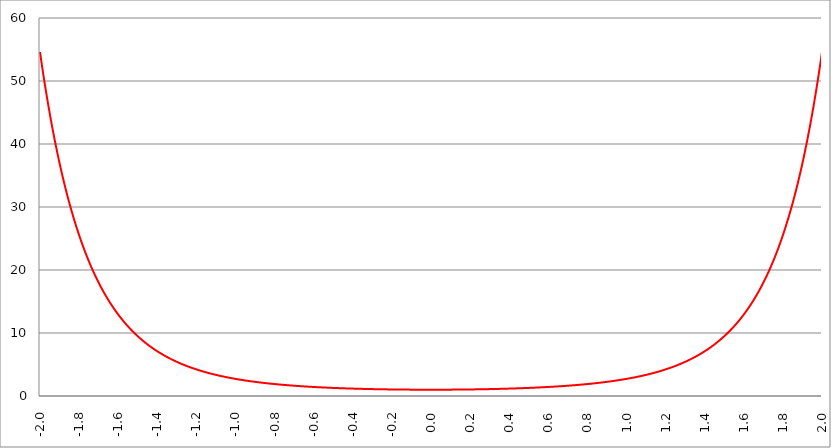
| Category | Series 1 | Series 0 | Series 2 |
|---|---|---|---|
| -2.0 | 54.598 |  |  |
| -1.998 | 54.163 |  |  |
| -1.996 | 53.732 |  |  |
| -1.994 | 53.305 |  |  |
| -1.992 | 52.882 |  |  |
| -1.99 | 52.463 |  |  |
| -1.988 | 52.047 |  |  |
| -1.986 | 51.635 |  |  |
| -1.984 | 51.226 |  |  |
| -1.982 | 50.822 |  |  |
| -1.98 | 50.421 |  |  |
| -1.978 | 50.023 |  |  |
| -1.976 | 49.629 |  |  |
| -1.974 | 49.239 |  |  |
| -1.972 | 48.851 |  |  |
| -1.97 | 48.468 |  |  |
| -1.968 | 48.088 |  |  |
| -1.966 | 47.711 |  |  |
| -1.964 | 47.337 |  |  |
| -1.962 | 46.967 |  |  |
| -1.96 | 46.6 |  |  |
| -1.958 | 46.236 |  |  |
| -1.956 | 45.876 |  |  |
| -1.954 | 45.518 |  |  |
| -1.952 | 45.164 |  |  |
| -1.95 | 44.813 |  |  |
| -1.948 | 44.465 |  |  |
| -1.946 | 44.12 |  |  |
| -1.944 | 43.778 |  |  |
| -1.942 | 43.439 |  |  |
| -1.94 | 43.103 |  |  |
| -1.938 | 42.77 |  |  |
| -1.936 | 42.44 |  |  |
| -1.934 | 42.113 |  |  |
| -1.932 | 41.789 |  |  |
| -1.93 | 41.467 |  |  |
| -1.928 | 41.148 |  |  |
| -1.926 | 40.832 |  |  |
| -1.924 | 40.519 |  |  |
| -1.922 | 40.209 |  |  |
| -1.92 | 39.901 |  |  |
| -1.918 | 39.596 |  |  |
| -1.916 | 39.293 |  |  |
| -1.914 | 38.994 |  |  |
| -1.912 | 38.696 |  |  |
| -1.91 | 38.402 |  |  |
| -1.908 | 38.11 |  |  |
| -1.906 | 37.82 |  |  |
| -1.904 | 37.533 |  |  |
| -1.902 | 37.248 |  |  |
| -1.9 | 36.966 |  |  |
| -1.898 | 36.686 |  |  |
| -1.896 | 36.409 |  |  |
| -1.894 | 36.134 |  |  |
| -1.892 | 35.861 |  |  |
| -1.89 | 35.591 |  |  |
| -1.888 | 35.323 |  |  |
| -1.886 | 35.058 |  |  |
| -1.884 | 34.794 |  |  |
| -1.882 | 34.533 |  |  |
| -1.88 | 34.274 |  |  |
| -1.878 | 34.018 |  |  |
| -1.876 | 33.763 |  |  |
| -1.874 | 33.511 |  |  |
| -1.872 | 33.261 |  |  |
| -1.87 | 33.013 |  |  |
| -1.868 | 32.767 |  |  |
| -1.866 | 32.523 |  |  |
| -1.864 | 32.282 |  |  |
| -1.862 | 32.042 |  |  |
| -1.86 | 31.804 |  |  |
| -1.858 | 31.569 |  |  |
| -1.856 | 31.335 |  |  |
| -1.854 | 31.103 |  |  |
| -1.852 | 30.874 |  |  |
| -1.85 | 30.646 |  |  |
| -1.848 | 30.42 |  |  |
| -1.846 | 30.196 |  |  |
| -1.844 | 29.974 |  |  |
| -1.842 | 29.754 |  |  |
| -1.84 | 29.536 |  |  |
| -1.838 | 29.319 |  |  |
| -1.836 | 29.105 |  |  |
| -1.834 | 28.892 |  |  |
| -1.832 | 28.681 |  |  |
| -1.83 | 28.471 |  |  |
| -1.828 | 28.264 |  |  |
| -1.826 | 28.058 |  |  |
| -1.824 | 27.854 |  |  |
| -1.822 | 27.652 |  |  |
| -1.82 | 27.451 |  |  |
| -1.818 | 27.252 |  |  |
| -1.816 | 27.055 |  |  |
| -1.814 | 26.859 |  |  |
| -1.812 | 26.665 |  |  |
| -1.81 | 26.472 |  |  |
| -1.808 | 26.281 |  |  |
| -1.806 | 26.092 |  |  |
| -1.804 | 25.904 |  |  |
| -1.802 | 25.718 |  |  |
| -1.8 | 25.534 |  |  |
| -1.798 | 25.351 |  |  |
| -1.796 | 25.169 |  |  |
| -1.794 | 24.989 |  |  |
| -1.792 | 24.81 |  |  |
| -1.79 | 24.633 |  |  |
| -1.788 | 24.458 |  |  |
| -1.786 | 24.283 |  |  |
| -1.784 | 24.111 |  |  |
| -1.782 | 23.939 |  |  |
| -1.78 | 23.769 |  |  |
| -1.778 | 23.601 |  |  |
| -1.776 | 23.434 |  |  |
| -1.774 | 23.268 |  |  |
| -1.772 | 23.103 |  |  |
| -1.77 | 22.94 |  |  |
| -1.768 | 22.779 |  |  |
| -1.766 | 22.618 |  |  |
| -1.764 | 22.459 |  |  |
| -1.762 | 22.301 |  |  |
| -1.76 | 22.145 |  |  |
| -1.758 | 21.989 |  |  |
| -1.756 | 21.835 |  |  |
| -1.754 | 21.683 |  |  |
| -1.752 | 21.531 |  |  |
| -1.75 | 21.381 |  |  |
| -1.748 | 21.232 |  |  |
| -1.746 | 21.084 |  |  |
| -1.744 | 20.937 |  |  |
| -1.742 | 20.792 |  |  |
| -1.74 | 20.648 |  |  |
| -1.738 | 20.504 |  |  |
| -1.736 | 20.363 |  |  |
| -1.734 | 20.222 |  |  |
| -1.732 | 20.082 |  |  |
| -1.73 | 19.943 |  |  |
| -1.728 | 19.806 |  |  |
| -1.726 | 19.67 |  |  |
| -1.724 | 19.534 |  |  |
| -1.722 | 19.4 |  |  |
| -1.72 | 19.267 |  |  |
| -1.718 | 19.135 |  |  |
| -1.716 | 19.004 |  |  |
| -1.714 | 18.874 |  |  |
| -1.712 | 18.745 |  |  |
| -1.71 | 18.617 |  |  |
| -1.708 | 18.491 |  |  |
| -1.706 | 18.365 |  |  |
| -1.704 | 18.24 |  |  |
| -1.702 | 18.116 |  |  |
| -1.7 | 17.993 |  |  |
| -1.698 | 17.871 |  |  |
| -1.696 | 17.751 |  |  |
| -1.694 | 17.631 |  |  |
| -1.692 | 17.512 |  |  |
| -1.69 | 17.394 |  |  |
| -1.688 | 17.276 |  |  |
| -1.686 | 17.16 |  |  |
| -1.684 | 17.045 |  |  |
| -1.682 | 16.931 |  |  |
| -1.68 | 16.817 |  |  |
| -1.678 | 16.705 |  |  |
| -1.676 | 16.593 |  |  |
| -1.674 | 16.482 |  |  |
| -1.672 | 16.372 |  |  |
| -1.67 | 16.263 |  |  |
| -1.668 | 16.155 |  |  |
| -1.666 | 16.048 |  |  |
| -1.664 | 15.941 |  |  |
| -1.662 | 15.835 |  |  |
| -1.66 | 15.73 |  |  |
| -1.658 | 15.626 |  |  |
| -1.656 | 15.523 |  |  |
| -1.654 | 15.421 |  |  |
| -1.652 | 15.319 |  |  |
| -1.65 | 15.218 |  |  |
| -1.648 | 15.118 |  |  |
| -1.646 | 15.019 |  |  |
| -1.644 | 14.92 |  |  |
| -1.642 | 14.823 |  |  |
| -1.64 | 14.726 |  |  |
| -1.638 | 14.63 |  |  |
| -1.636 | 14.534 |  |  |
| -1.634 | 14.439 |  |  |
| -1.632 | 14.345 |  |  |
| -1.63 | 14.252 |  |  |
| -1.628 | 14.159 |  |  |
| -1.626 | 14.068 |  |  |
| -1.624 | 13.976 |  |  |
| -1.622 | 13.886 |  |  |
| -1.62 | 13.796 |  |  |
| -1.618 | 13.707 |  |  |
| -1.616 | 13.619 |  |  |
| -1.614 | 13.531 |  |  |
| -1.612 | 13.444 |  |  |
| -1.61 | 13.358 |  |  |
| -1.608 | 13.272 |  |  |
| -1.606 | 13.187 |  |  |
| -1.604 | 13.103 |  |  |
| -1.602 | 13.019 |  |  |
| -1.6 | 12.936 |  |  |
| -1.598 | 12.853 |  |  |
| -1.596 | 12.771 |  |  |
| -1.594 | 12.69 |  |  |
| -1.592 | 12.61 |  |  |
| -1.59 | 12.53 |  |  |
| -1.588 | 12.45 |  |  |
| -1.586 | 12.372 |  |  |
| -1.584 | 12.293 |  |  |
| -1.582 | 12.216 |  |  |
| -1.58 | 12.139 |  |  |
| -1.578 | 12.062 |  |  |
| -1.576 | 11.986 |  |  |
| -1.574 | 11.911 |  |  |
| -1.572 | 11.836 |  |  |
| -1.57 | 11.762 |  |  |
| -1.568 | 11.689 |  |  |
| -1.566 | 11.616 |  |  |
| -1.564 | 11.543 |  |  |
| -1.562 | 11.471 |  |  |
| -1.56 | 11.4 |  |  |
| -1.558 | 11.329 |  |  |
| -1.556 | 11.259 |  |  |
| -1.554 | 11.189 |  |  |
| -1.552 | 11.12 |  |  |
| -1.55 | 11.051 |  |  |
| -1.548 | 10.983 |  |  |
| -1.546 | 10.915 |  |  |
| -1.544 | 10.848 |  |  |
| -1.542 | 10.781 |  |  |
| -1.54 | 10.715 |  |  |
| -1.538 | 10.649 |  |  |
| -1.536 | 10.583 |  |  |
| -1.534 | 10.519 |  |  |
| -1.532 | 10.454 |  |  |
| -1.53 | 10.391 |  |  |
| -1.528 | 10.327 |  |  |
| -1.526 | 10.264 |  |  |
| -1.524 | 10.202 |  |  |
| -1.522 | 10.14 |  |  |
| -1.52 | 10.078 |  |  |
| -1.518 | 10.017 |  |  |
| -1.516 | 9.957 |  |  |
| -1.514 | 9.897 |  |  |
| -1.512 | 9.837 |  |  |
| -1.51 | 9.778 |  |  |
| -1.508 | 9.719 |  |  |
| -1.506 | 9.66 |  |  |
| -1.504 | 9.602 |  |  |
| -1.502 | 9.545 |  |  |
| -1.5 | 9.488 |  |  |
| -1.498 | 9.431 |  |  |
| -1.496 | 9.375 |  |  |
| -1.494 | 9.319 |  |  |
| -1.492 | 9.263 |  |  |
| -1.49 | 9.208 |  |  |
| -1.488 | 9.154 |  |  |
| -1.486 | 9.099 |  |  |
| -1.484 | 9.045 |  |  |
| -1.482 | 8.992 |  |  |
| -1.48 | 8.939 |  |  |
| -1.478 | 8.886 |  |  |
| -1.476 | 8.834 |  |  |
| -1.474 | 8.782 |  |  |
| -1.472 | 8.73 |  |  |
| -1.469999999999999 | 8.679 |  |  |
| -1.467999999999999 | 8.628 |  |  |
| -1.465999999999999 | 8.578 |  |  |
| -1.463999999999999 | 8.527 |  |  |
| -1.461999999999999 | 8.478 |  |  |
| -1.459999999999999 | 8.428 |  |  |
| -1.457999999999999 | 8.379 |  |  |
| -1.455999999999999 | 8.331 |  |  |
| -1.453999999999999 | 8.282 |  |  |
| -1.451999999999999 | 8.234 |  |  |
| -1.449999999999999 | 8.187 |  |  |
| -1.447999999999999 | 8.139 |  |  |
| -1.445999999999999 | 8.092 |  |  |
| -1.443999999999999 | 8.046 |  |  |
| -1.441999999999999 | 7.999 |  |  |
| -1.439999999999999 | 7.953 |  |  |
| -1.437999999999999 | 7.908 |  |  |
| -1.435999999999999 | 7.862 |  |  |
| -1.433999999999999 | 7.817 |  |  |
| -1.431999999999999 | 7.773 |  |  |
| -1.429999999999999 | 7.728 |  |  |
| -1.427999999999999 | 7.684 |  |  |
| -1.425999999999999 | 7.641 |  |  |
| -1.423999999999999 | 7.597 |  |  |
| -1.421999999999999 | 7.554 |  |  |
| -1.419999999999999 | 7.511 |  |  |
| -1.417999999999999 | 7.469 |  |  |
| -1.415999999999999 | 7.427 |  |  |
| -1.413999999999999 | 7.385 |  |  |
| -1.411999999999999 | 7.343 |  |  |
| -1.409999999999999 | 7.302 |  |  |
| -1.407999999999999 | 7.261 |  |  |
| -1.405999999999999 | 7.22 |  |  |
| -1.403999999999999 | 7.179 |  |  |
| -1.401999999999999 | 7.139 |  |  |
| -1.399999999999999 | 7.099 |  |  |
| -1.397999999999999 | 7.06 |  |  |
| -1.395999999999999 | 7.02 |  |  |
| -1.393999999999999 | 6.981 |  |  |
| -1.391999999999999 | 6.943 |  |  |
| -1.389999999999999 | 6.904 |  |  |
| -1.387999999999999 | 6.866 |  |  |
| -1.385999999999999 | 6.828 |  |  |
| -1.383999999999999 | 6.79 |  |  |
| -1.381999999999999 | 6.753 |  |  |
| -1.379999999999999 | 6.715 |  |  |
| -1.377999999999999 | 6.678 |  |  |
| -1.375999999999999 | 6.642 |  |  |
| -1.373999999999999 | 6.605 |  |  |
| -1.371999999999999 | 6.569 |  |  |
| -1.369999999999999 | 6.533 |  |  |
| -1.367999999999999 | 6.498 |  |  |
| -1.365999999999999 | 6.462 |  |  |
| -1.363999999999999 | 6.427 |  |  |
| -1.361999999999999 | 6.392 |  |  |
| -1.359999999999999 | 6.357 |  |  |
| -1.357999999999999 | 6.323 |  |  |
| -1.355999999999999 | 6.289 |  |  |
| -1.353999999999999 | 6.255 |  |  |
| -1.351999999999999 | 6.221 |  |  |
| -1.349999999999999 | 6.187 |  |  |
| -1.347999999999999 | 6.154 |  |  |
| -1.345999999999999 | 6.121 |  |  |
| -1.343999999999999 | 6.088 |  |  |
| -1.341999999999999 | 6.055 |  |  |
| -1.339999999999999 | 6.023 |  |  |
| -1.337999999999999 | 5.991 |  |  |
| -1.335999999999999 | 5.959 |  |  |
| -1.333999999999999 | 5.927 |  |  |
| -1.331999999999999 | 5.896 |  |  |
| -1.329999999999999 | 5.864 |  |  |
| -1.327999999999999 | 5.833 |  |  |
| -1.325999999999999 | 5.802 |  |  |
| -1.323999999999999 | 5.772 |  |  |
| -1.321999999999999 | 5.741 |  |  |
| -1.319999999999999 | 5.711 |  |  |
| -1.317999999999999 | 5.681 |  |  |
| -1.315999999999999 | 5.651 |  |  |
| -1.313999999999999 | 5.621 |  |  |
| -1.311999999999999 | 5.592 |  |  |
| -1.309999999999999 | 5.563 |  |  |
| -1.307999999999999 | 5.534 |  |  |
| -1.305999999999999 | 5.505 |  |  |
| -1.303999999999999 | 5.476 |  |  |
| -1.301999999999999 | 5.448 |  |  |
| -1.299999999999999 | 5.419 |  |  |
| -1.297999999999999 | 5.391 |  |  |
| -1.295999999999999 | 5.363 |  |  |
| -1.293999999999999 | 5.336 |  |  |
| -1.291999999999999 | 5.308 |  |  |
| -1.289999999999999 | 5.281 |  |  |
| -1.287999999999999 | 5.254 |  |  |
| -1.285999999999999 | 5.227 |  |  |
| -1.283999999999999 | 5.2 |  |  |
| -1.281999999999999 | 5.173 |  |  |
| -1.279999999999999 | 5.147 |  |  |
| -1.277999999999999 | 5.121 |  |  |
| -1.275999999999999 | 5.095 |  |  |
| -1.273999999999999 | 5.069 |  |  |
| -1.271999999999999 | 5.043 |  |  |
| -1.269999999999999 | 5.017 |  |  |
| -1.267999999999999 | 4.992 |  |  |
| -1.265999999999999 | 4.967 |  |  |
| -1.263999999999999 | 4.942 |  |  |
| -1.261999999999999 | 4.917 |  |  |
| -1.259999999999999 | 4.892 |  |  |
| -1.257999999999999 | 4.867 |  |  |
| -1.255999999999999 | 4.843 |  |  |
| -1.253999999999999 | 4.819 |  |  |
| -1.251999999999999 | 4.795 |  |  |
| -1.249999999999999 | 4.771 |  |  |
| -1.247999999999999 | 4.747 |  |  |
| -1.245999999999999 | 4.723 |  |  |
| -1.243999999999999 | 4.7 |  |  |
| -1.241999999999999 | 4.677 |  |  |
| -1.239999999999999 | 4.653 |  |  |
| -1.237999999999999 | 4.63 |  |  |
| -1.235999999999999 | 4.608 |  |  |
| -1.233999999999999 | 4.585 |  |  |
| -1.231999999999999 | 4.562 |  |  |
| -1.229999999999999 | 4.54 |  |  |
| -1.227999999999999 | 4.518 |  |  |
| -1.225999999999999 | 4.495 |  |  |
| -1.223999999999999 | 4.474 |  |  |
| -1.221999999999999 | 4.452 |  |  |
| -1.219999999999999 | 4.43 |  |  |
| -1.217999999999999 | 4.408 |  |  |
| -1.215999999999999 | 4.387 |  |  |
| -1.213999999999999 | 4.366 |  |  |
| -1.211999999999999 | 4.345 |  |  |
| -1.209999999999999 | 4.324 |  |  |
| -1.207999999999999 | 4.303 |  |  |
| -1.205999999999999 | 4.282 |  |  |
| -1.203999999999999 | 4.261 |  |  |
| -1.201999999999999 | 4.241 |  |  |
| -1.199999999999999 | 4.221 |  |  |
| -1.197999999999999 | 4.201 |  |  |
| -1.195999999999999 | 4.18 |  |  |
| -1.193999999999999 | 4.161 |  |  |
| -1.191999999999999 | 4.141 |  |  |
| -1.189999999999999 | 4.121 |  |  |
| -1.187999999999999 | 4.101 |  |  |
| -1.185999999999999 | 4.082 |  |  |
| -1.183999999999999 | 4.063 |  |  |
| -1.181999999999999 | 4.044 |  |  |
| -1.179999999999999 | 4.024 |  |  |
| -1.177999999999999 | 4.006 |  |  |
| -1.175999999999999 | 3.987 |  |  |
| -1.173999999999999 | 3.968 |  |  |
| -1.171999999999999 | 3.949 |  |  |
| -1.169999999999999 | 3.931 |  |  |
| -1.167999999999999 | 3.913 |  |  |
| -1.165999999999999 | 3.894 |  |  |
| -1.163999999999999 | 3.876 |  |  |
| -1.161999999999999 | 3.858 |  |  |
| -1.159999999999999 | 3.84 |  |  |
| -1.157999999999999 | 3.823 |  |  |
| -1.155999999999999 | 3.805 |  |  |
| -1.153999999999999 | 3.788 |  |  |
| -1.151999999999999 | 3.77 |  |  |
| -1.149999999999999 | 3.753 |  |  |
| -1.147999999999999 | 3.736 |  |  |
| -1.145999999999999 | 3.718 |  |  |
| -1.143999999999999 | 3.701 |  |  |
| -1.141999999999999 | 3.685 |  |  |
| -1.139999999999999 | 3.668 |  |  |
| -1.137999999999999 | 3.651 |  |  |
| -1.135999999999999 | 3.635 |  |  |
| -1.133999999999999 | 3.618 |  |  |
| -1.131999999999999 | 3.602 |  |  |
| -1.129999999999999 | 3.586 |  |  |
| -1.127999999999999 | 3.569 |  |  |
| -1.125999999999999 | 3.553 |  |  |
| -1.123999999999999 | 3.537 |  |  |
| -1.121999999999999 | 3.521 |  |  |
| -1.119999999999999 | 3.506 |  |  |
| -1.117999999999999 | 3.49 |  |  |
| -1.115999999999999 | 3.475 |  |  |
| -1.113999999999999 | 3.459 |  |  |
| -1.111999999999999 | 3.444 |  |  |
| -1.109999999999999 | 3.428 |  |  |
| -1.107999999999999 | 3.413 |  |  |
| -1.105999999999999 | 3.398 |  |  |
| -1.103999999999999 | 3.383 |  |  |
| -1.101999999999999 | 3.368 |  |  |
| -1.099999999999999 | 3.353 |  |  |
| -1.097999999999999 | 3.339 |  |  |
| -1.095999999999999 | 3.324 |  |  |
| -1.093999999999999 | 3.31 |  |  |
| -1.091999999999999 | 3.295 |  |  |
| -1.089999999999999 | 3.281 |  |  |
| -1.087999999999999 | 3.267 |  |  |
| -1.085999999999999 | 3.252 |  |  |
| -1.083999999999999 | 3.238 |  |  |
| -1.081999999999999 | 3.224 |  |  |
| -1.079999999999999 | 3.21 |  |  |
| -1.077999999999999 | 3.197 |  |  |
| -1.075999999999999 | 3.183 |  |  |
| -1.073999999999999 | 3.169 |  |  |
| -1.071999999999999 | 3.156 |  |  |
| -1.069999999999999 | 3.142 |  |  |
| -1.067999999999999 | 3.129 |  |  |
| -1.065999999999999 | 3.115 |  |  |
| -1.063999999999999 | 3.102 |  |  |
| -1.061999999999999 | 3.089 |  |  |
| -1.059999999999999 | 3.076 |  |  |
| -1.057999999999999 | 3.063 |  |  |
| -1.055999999999999 | 3.05 |  |  |
| -1.053999999999999 | 3.037 |  |  |
| -1.051999999999999 | 3.024 |  |  |
| -1.049999999999999 | 3.012 |  |  |
| -1.047999999999999 | 2.999 |  |  |
| -1.045999999999999 | 2.987 |  |  |
| -1.043999999999999 | 2.974 |  |  |
| -1.041999999999999 | 2.962 |  |  |
| -1.039999999999999 | 2.949 |  |  |
| -1.037999999999999 | 2.937 |  |  |
| -1.035999999999999 | 2.925 |  |  |
| -1.033999999999999 | 2.913 |  |  |
| -1.031999999999999 | 2.901 |  |  |
| -1.029999999999999 | 2.889 |  |  |
| -1.027999999999999 | 2.877 |  |  |
| -1.025999999999999 | 2.865 |  |  |
| -1.023999999999999 | 2.854 |  |  |
| -1.021999999999999 | 2.842 |  |  |
| -1.019999999999999 | 2.83 |  |  |
| -1.017999999999999 | 2.819 |  |  |
| -1.015999999999999 | 2.807 |  |  |
| -1.013999999999999 | 2.796 |  |  |
| -1.011999999999999 | 2.785 |  |  |
| -1.009999999999999 | 2.773 |  |  |
| -1.007999999999999 | 2.762 |  |  |
| -1.005999999999999 | 2.751 |  |  |
| -1.003999999999999 | 2.74 |  |  |
| -1.001999999999999 | 2.729 |  |  |
| -0.999999999999999 | 2.718 |  |  |
| -0.997999999999999 | 2.707 |  |  |
| -0.995999999999999 | 2.697 |  |  |
| -0.993999999999999 | 2.686 |  |  |
| -0.991999999999999 | 2.675 |  |  |
| -0.989999999999999 | 2.665 |  |  |
| -0.987999999999999 | 2.654 |  |  |
| -0.985999999999999 | 2.644 |  |  |
| -0.983999999999999 | 2.633 |  |  |
| -0.981999999999999 | 2.623 |  |  |
| -0.979999999999999 | 2.613 |  |  |
| -0.977999999999999 | 2.603 |  |  |
| -0.975999999999999 | 2.592 |  |  |
| -0.973999999999999 | 2.582 |  |  |
| -0.971999999999999 | 2.572 |  |  |
| -0.969999999999999 | 2.562 |  |  |
| -0.967999999999999 | 2.552 |  |  |
| -0.965999999999999 | 2.543 |  |  |
| -0.963999999999999 | 2.533 |  |  |
| -0.961999999999999 | 2.523 |  |  |
| -0.959999999999999 | 2.513 |  |  |
| -0.957999999999999 | 2.504 |  |  |
| -0.955999999999999 | 2.494 |  |  |
| -0.953999999999999 | 2.485 |  |  |
| -0.951999999999999 | 2.475 |  |  |
| -0.949999999999999 | 2.466 |  |  |
| -0.947999999999999 | 2.456 |  |  |
| -0.945999999999999 | 2.447 |  |  |
| -0.943999999999999 | 2.438 |  |  |
| -0.941999999999999 | 2.429 |  |  |
| -0.939999999999999 | 2.42 |  |  |
| -0.937999999999999 | 2.411 |  |  |
| -0.935999999999999 | 2.402 |  |  |
| -0.933999999999999 | 2.393 |  |  |
| -0.931999999999999 | 2.384 |  |  |
| -0.929999999999999 | 2.375 |  |  |
| -0.927999999999999 | 2.366 |  |  |
| -0.925999999999999 | 2.357 |  |  |
| -0.923999999999999 | 2.348 |  |  |
| -0.921999999999999 | 2.34 |  |  |
| -0.919999999999999 | 2.331 |  |  |
| -0.917999999999999 | 2.323 |  |  |
| -0.915999999999999 | 2.314 |  |  |
| -0.913999999999999 | 2.306 |  |  |
| -0.911999999999999 | 2.297 |  |  |
| -0.909999999999999 | 2.289 |  |  |
| -0.907999999999999 | 2.281 |  |  |
| -0.905999999999999 | 2.272 |  |  |
| -0.903999999999999 | 2.264 |  |  |
| -0.901999999999999 | 2.256 |  |  |
| -0.899999999999999 | 2.248 |  |  |
| -0.897999999999999 | 2.24 |  |  |
| -0.895999999999999 | 2.232 |  |  |
| -0.893999999999999 | 2.224 |  |  |
| -0.891999999999999 | 2.216 |  |  |
| -0.889999999999999 | 2.208 |  |  |
| -0.887999999999999 | 2.2 |  |  |
| -0.885999999999999 | 2.192 |  |  |
| -0.883999999999999 | 2.185 |  |  |
| -0.881999999999999 | 2.177 |  |  |
| -0.879999999999999 | 2.169 |  |  |
| -0.877999999999999 | 2.162 |  |  |
| -0.875999999999999 | 2.154 |  |  |
| -0.873999999999999 | 2.147 |  |  |
| -0.871999999999999 | 2.139 |  |  |
| -0.869999999999999 | 2.132 |  |  |
| -0.867999999999999 | 2.124 |  |  |
| -0.865999999999999 | 2.117 |  |  |
| -0.863999999999999 | 2.11 |  |  |
| -0.861999999999999 | 2.102 |  |  |
| -0.859999999999999 | 2.095 |  |  |
| -0.857999999999999 | 2.088 |  |  |
| -0.855999999999999 | 2.081 |  |  |
| -0.853999999999999 | 2.074 |  |  |
| -0.851999999999999 | 2.067 |  |  |
| -0.849999999999999 | 2.06 |  |  |
| -0.847999999999999 | 2.053 |  |  |
| -0.845999999999999 | 2.046 |  |  |
| -0.843999999999999 | 2.039 |  |  |
| -0.841999999999999 | 2.032 |  |  |
| -0.839999999999999 | 2.025 |  |  |
| -0.837999999999999 | 2.018 |  |  |
| -0.835999999999999 | 2.012 |  |  |
| -0.833999999999999 | 2.005 |  |  |
| -0.831999999999999 | 1.998 |  |  |
| -0.829999999999999 | 1.992 |  |  |
| -0.827999999999999 | 1.985 |  |  |
| -0.825999999999999 | 1.978 |  |  |
| -0.823999999999999 | 1.972 |  |  |
| -0.821999999999999 | 1.965 |  |  |
| -0.819999999999999 | 1.959 |  |  |
| -0.817999999999999 | 1.953 |  |  |
| -0.815999999999999 | 1.946 |  |  |
| -0.813999999999999 | 1.94 |  |  |
| -0.811999999999999 | 1.934 |  |  |
| -0.809999999999999 | 1.927 |  |  |
| -0.807999999999999 | 1.921 |  |  |
| -0.805999999999999 | 1.915 |  |  |
| -0.803999999999999 | 1.909 |  |  |
| -0.801999999999999 | 1.903 |  |  |
| -0.799999999999999 | 1.896 |  |  |
| -0.797999999999999 | 1.89 |  |  |
| -0.795999999999999 | 1.884 |  |  |
| -0.793999999999999 | 1.878 |  |  |
| -0.791999999999999 | 1.872 |  |  |
| -0.789999999999999 | 1.867 |  |  |
| -0.787999999999999 | 1.861 |  |  |
| -0.785999999999999 | 1.855 |  |  |
| -0.783999999999999 | 1.849 |  |  |
| -0.781999999999999 | 1.843 |  |  |
| -0.779999999999999 | 1.837 |  |  |
| -0.777999999999999 | 1.832 |  |  |
| -0.775999999999999 | 1.826 |  |  |
| -0.773999999999999 | 1.82 |  |  |
| -0.771999999999999 | 1.815 |  |  |
| -0.769999999999999 | 1.809 |  |  |
| -0.767999999999999 | 1.804 |  |  |
| -0.765999999999999 | 1.798 |  |  |
| -0.763999999999999 | 1.793 |  |  |
| -0.761999999999999 | 1.787 |  |  |
| -0.759999999999999 | 1.782 |  |  |
| -0.757999999999999 | 1.776 |  |  |
| -0.755999999999999 | 1.771 |  |  |
| -0.753999999999999 | 1.766 |  |  |
| -0.751999999999999 | 1.76 |  |  |
| -0.749999999999999 | 1.755 |  |  |
| -0.747999999999999 | 1.75 |  |  |
| -0.745999999999999 | 1.745 |  |  |
| -0.743999999999999 | 1.739 |  |  |
| -0.741999999999999 | 1.734 |  |  |
| -0.739999999999999 | 1.729 |  |  |
| -0.737999999999999 | 1.724 |  |  |
| -0.735999999999999 | 1.719 |  |  |
| -0.733999999999999 | 1.714 |  |  |
| -0.731999999999999 | 1.709 |  |  |
| -0.729999999999999 | 1.704 |  |  |
| -0.727999999999999 | 1.699 |  |  |
| -0.725999999999999 | 1.694 |  |  |
| -0.723999999999999 | 1.689 |  |  |
| -0.721999999999999 | 1.684 |  |  |
| -0.719999999999999 | 1.679 |  |  |
| -0.717999999999999 | 1.675 |  |  |
| -0.715999999999999 | 1.67 |  |  |
| -0.713999999999999 | 1.665 |  |  |
| -0.711999999999999 | 1.66 |  |  |
| -0.709999999999999 | 1.655 |  |  |
| -0.707999999999999 | 1.651 |  |  |
| -0.705999999999999 | 1.646 |  |  |
| -0.703999999999999 | 1.642 |  |  |
| -0.701999999999999 | 1.637 |  |  |
| -0.699999999999999 | 1.632 |  |  |
| -0.697999999999999 | 1.628 |  |  |
| -0.695999999999999 | 1.623 |  |  |
| -0.693999999999999 | 1.619 |  |  |
| -0.691999999999999 | 1.614 |  |  |
| -0.689999999999999 | 1.61 |  |  |
| -0.687999999999999 | 1.605 |  |  |
| -0.685999999999999 | 1.601 |  |  |
| -0.683999999999999 | 1.597 |  |  |
| -0.681999999999999 | 1.592 |  |  |
| -0.679999999999999 | 1.588 |  |  |
| -0.677999999999999 | 1.584 |  |  |
| -0.675999999999999 | 1.579 |  |  |
| -0.673999999999999 | 1.575 |  |  |
| -0.671999999999999 | 1.571 |  |  |
| -0.669999999999999 | 1.567 |  |  |
| -0.667999999999999 | 1.562 |  |  |
| -0.665999999999999 | 1.558 |  |  |
| -0.663999999999999 | 1.554 |  |  |
| -0.661999999999999 | 1.55 |  |  |
| -0.659999999999999 | 1.546 |  |  |
| -0.657999999999999 | 1.542 |  |  |
| -0.655999999999999 | 1.538 |  |  |
| -0.653999999999999 | 1.534 |  |  |
| -0.651999999999999 | 1.53 |  |  |
| -0.649999999999999 | 1.526 |  |  |
| -0.647999999999999 | 1.522 |  |  |
| -0.645999999999999 | 1.518 |  |  |
| -0.643999999999999 | 1.514 |  |  |
| -0.641999999999999 | 1.51 |  |  |
| -0.639999999999999 | 1.506 |  |  |
| -0.637999999999999 | 1.502 |  |  |
| -0.635999999999999 | 1.499 |  |  |
| -0.633999999999999 | 1.495 |  |  |
| -0.631999999999999 | 1.491 |  |  |
| -0.629999999999999 | 1.487 |  |  |
| -0.627999999999999 | 1.483 |  |  |
| -0.625999999999999 | 1.48 |  |  |
| -0.623999999999999 | 1.476 |  |  |
| -0.621999999999999 | 1.472 |  |  |
| -0.619999999999999 | 1.469 |  |  |
| -0.617999999999999 | 1.465 |  |  |
| -0.615999999999999 | 1.461 |  |  |
| -0.613999999999999 | 1.458 |  |  |
| -0.611999999999999 | 1.454 |  |  |
| -0.609999999999999 | 1.451 |  |  |
| -0.607999999999999 | 1.447 |  |  |
| -0.605999999999999 | 1.444 |  |  |
| -0.603999999999999 | 1.44 |  |  |
| -0.601999999999999 | 1.437 |  |  |
| -0.599999999999999 | 1.433 |  |  |
| -0.597999999999999 | 1.43 |  |  |
| -0.595999999999999 | 1.426 |  |  |
| -0.593999999999999 | 1.423 |  |  |
| -0.591999999999999 | 1.42 |  |  |
| -0.589999999999999 | 1.416 |  |  |
| -0.587999999999999 | 1.413 |  |  |
| -0.585999999999999 | 1.41 |  |  |
| -0.583999999999999 | 1.406 |  |  |
| -0.581999999999999 | 1.403 |  |  |
| -0.579999999999999 | 1.4 |  |  |
| -0.577999999999999 | 1.397 |  |  |
| -0.575999999999999 | 1.393 |  |  |
| -0.573999999999999 | 1.39 |  |  |
| -0.571999999999999 | 1.387 |  |  |
| -0.569999999999999 | 1.384 |  |  |
| -0.567999999999999 | 1.381 |  |  |
| -0.565999999999999 | 1.378 |  |  |
| -0.563999999999999 | 1.375 |  |  |
| -0.561999999999999 | 1.371 |  |  |
| -0.559999999999999 | 1.368 |  |  |
| -0.557999999999999 | 1.365 |  |  |
| -0.555999999999999 | 1.362 |  |  |
| -0.553999999999999 | 1.359 |  |  |
| -0.551999999999999 | 1.356 |  |  |
| -0.549999999999999 | 1.353 |  |  |
| -0.547999999999999 | 1.35 |  |  |
| -0.545999999999999 | 1.347 |  |  |
| -0.543999999999999 | 1.344 |  |  |
| -0.541999999999999 | 1.341 |  |  |
| -0.539999999999999 | 1.339 |  |  |
| -0.537999999999999 | 1.336 |  |  |
| -0.535999999999999 | 1.333 |  |  |
| -0.533999999999999 | 1.33 |  |  |
| -0.531999999999999 | 1.327 |  |  |
| -0.529999999999999 | 1.324 |  |  |
| -0.527999999999999 | 1.322 |  |  |
| -0.525999999999999 | 1.319 |  |  |
| -0.523999999999999 | 1.316 |  |  |
| -0.521999999999999 | 1.313 |  |  |
| -0.519999999999999 | 1.31 |  |  |
| -0.517999999999999 | 1.308 |  |  |
| -0.515999999999999 | 1.305 |  |  |
| -0.513999999999999 | 1.302 |  |  |
| -0.511999999999999 | 1.3 |  |  |
| -0.509999999999999 | 1.297 |  |  |
| -0.507999999999999 | 1.294 |  |  |
| -0.505999999999999 | 1.292 |  |  |
| -0.503999999999999 | 1.289 |  |  |
| -0.501999999999999 | 1.287 |  |  |
| -0.499999999999999 | 1.284 |  |  |
| -0.497999999999999 | 1.281 |  |  |
| -0.495999999999999 | 1.279 |  |  |
| -0.493999999999999 | 1.276 |  |  |
| -0.491999999999999 | 1.274 |  |  |
| -0.489999999999999 | 1.271 |  |  |
| -0.487999999999999 | 1.269 |  |  |
| -0.485999999999999 | 1.266 |  |  |
| -0.483999999999999 | 1.264 |  |  |
| -0.481999999999999 | 1.262 |  |  |
| -0.479999999999999 | 1.259 |  |  |
| -0.477999999999999 | 1.257 |  |  |
| -0.475999999999999 | 1.254 |  |  |
| -0.473999999999999 | 1.252 |  |  |
| -0.471999999999999 | 1.25 |  |  |
| -0.469999999999999 | 1.247 |  |  |
| -0.467999999999999 | 1.245 |  |  |
| -0.465999999999999 | 1.243 |  |  |
| -0.463999999999999 | 1.24 |  |  |
| -0.461999999999999 | 1.238 |  |  |
| -0.459999999999999 | 1.236 |  |  |
| -0.457999999999999 | 1.233 |  |  |
| -0.455999999999999 | 1.231 |  |  |
| -0.453999999999999 | 1.229 |  |  |
| -0.451999999999999 | 1.227 |  |  |
| -0.449999999999999 | 1.224 |  |  |
| -0.447999999999999 | 1.222 |  |  |
| -0.445999999999999 | 1.22 |  |  |
| -0.443999999999999 | 1.218 |  |  |
| -0.441999999999999 | 1.216 |  |  |
| -0.439999999999999 | 1.214 |  |  |
| -0.437999999999999 | 1.211 |  |  |
| -0.435999999999999 | 1.209 |  |  |
| -0.433999999999999 | 1.207 |  |  |
| -0.431999999999999 | 1.205 |  |  |
| -0.429999999999999 | 1.203 |  |  |
| -0.427999999999999 | 1.201 |  |  |
| -0.425999999999999 | 1.199 |  |  |
| -0.423999999999999 | 1.197 |  |  |
| -0.421999999999999 | 1.195 |  |  |
| -0.419999999999999 | 1.193 |  |  |
| -0.417999999999999 | 1.191 |  |  |
| -0.415999999999999 | 1.189 |  |  |
| -0.413999999999999 | 1.187 |  |  |
| -0.411999999999999 | 1.185 |  |  |
| -0.409999999999999 | 1.183 |  |  |
| -0.407999999999999 | 1.181 |  |  |
| -0.405999999999999 | 1.179 |  |  |
| -0.403999999999999 | 1.177 |  |  |
| -0.401999999999999 | 1.175 |  |  |
| -0.399999999999999 | 1.174 |  |  |
| -0.397999999999999 | 1.172 |  |  |
| -0.395999999999999 | 1.17 |  |  |
| -0.393999999999999 | 1.168 |  |  |
| -0.391999999999999 | 1.166 |  |  |
| -0.389999999999999 | 1.164 |  |  |
| -0.387999999999999 | 1.162 |  |  |
| -0.385999999999999 | 1.161 |  |  |
| -0.383999999999999 | 1.159 |  |  |
| -0.381999999999999 | 1.157 |  |  |
| -0.379999999999999 | 1.155 |  |  |
| -0.377999999999999 | 1.154 |  |  |
| -0.375999999999999 | 1.152 |  |  |
| -0.373999999999999 | 1.15 |  |  |
| -0.371999999999999 | 1.148 |  |  |
| -0.369999999999998 | 1.147 |  |  |
| -0.367999999999998 | 1.145 |  |  |
| -0.365999999999998 | 1.143 |  |  |
| -0.363999999999998 | 1.142 |  |  |
| -0.361999999999998 | 1.14 |  |  |
| -0.359999999999998 | 1.138 |  |  |
| -0.357999999999998 | 1.137 |  |  |
| -0.355999999999998 | 1.135 |  |  |
| -0.353999999999998 | 1.134 |  |  |
| -0.351999999999998 | 1.132 |  |  |
| -0.349999999999998 | 1.13 |  |  |
| -0.347999999999998 | 1.129 |  |  |
| -0.345999999999998 | 1.127 |  |  |
| -0.343999999999998 | 1.126 |  |  |
| -0.341999999999998 | 1.124 |  |  |
| -0.339999999999998 | 1.123 |  |  |
| -0.337999999999998 | 1.121 |  |  |
| -0.335999999999998 | 1.12 |  |  |
| -0.333999999999998 | 1.118 |  |  |
| -0.331999999999998 | 1.117 |  |  |
| -0.329999999999998 | 1.115 |  |  |
| -0.327999999999998 | 1.114 |  |  |
| -0.325999999999998 | 1.112 |  |  |
| -0.323999999999998 | 1.111 |  |  |
| -0.321999999999998 | 1.109 |  |  |
| -0.319999999999998 | 1.108 |  |  |
| -0.317999999999998 | 1.106 |  |  |
| -0.315999999999998 | 1.105 |  |  |
| -0.313999999999998 | 1.104 |  |  |
| -0.311999999999998 | 1.102 |  |  |
| -0.309999999999998 | 1.101 |  |  |
| -0.307999999999998 | 1.1 |  |  |
| -0.305999999999998 | 1.098 |  |  |
| -0.303999999999998 | 1.097 |  |  |
| -0.301999999999998 | 1.095 |  |  |
| -0.299999999999998 | 1.094 |  |  |
| -0.297999999999998 | 1.093 |  |  |
| -0.295999999999998 | 1.092 |  |  |
| -0.293999999999998 | 1.09 |  |  |
| -0.291999999999998 | 1.089 |  |  |
| -0.289999999999998 | 1.088 |  |  |
| -0.287999999999998 | 1.086 |  |  |
| -0.285999999999998 | 1.085 |  |  |
| -0.283999999999998 | 1.084 |  |  |
| -0.281999999999998 | 1.083 |  |  |
| -0.279999999999998 | 1.082 |  |  |
| -0.277999999999998 | 1.08 |  |  |
| -0.275999999999998 | 1.079 |  |  |
| -0.273999999999998 | 1.078 |  |  |
| -0.271999999999998 | 1.077 |  |  |
| -0.269999999999998 | 1.076 |  |  |
| -0.267999999999998 | 1.074 |  |  |
| -0.265999999999998 | 1.073 |  |  |
| -0.263999999999998 | 1.072 |  |  |
| -0.261999999999998 | 1.071 |  |  |
| -0.259999999999998 | 1.07 |  |  |
| -0.257999999999998 | 1.069 |  |  |
| -0.255999999999998 | 1.068 |  |  |
| -0.253999999999998 | 1.067 |  |  |
| -0.251999999999998 | 1.066 |  |  |
| -0.249999999999998 | 1.064 |  |  |
| -0.247999999999998 | 1.063 |  |  |
| -0.245999999999998 | 1.062 |  |  |
| -0.243999999999998 | 1.061 |  |  |
| -0.241999999999998 | 1.06 |  |  |
| -0.239999999999998 | 1.059 |  |  |
| -0.237999999999998 | 1.058 |  |  |
| -0.235999999999998 | 1.057 |  |  |
| -0.233999999999998 | 1.056 |  |  |
| -0.231999999999998 | 1.055 |  |  |
| -0.229999999999998 | 1.054 |  |  |
| -0.227999999999998 | 1.053 |  |  |
| -0.225999999999998 | 1.052 |  |  |
| -0.223999999999998 | 1.051 |  |  |
| -0.221999999999998 | 1.051 |  |  |
| -0.219999999999998 | 1.05 |  |  |
| -0.217999999999998 | 1.049 |  |  |
| -0.215999999999998 | 1.048 |  |  |
| -0.213999999999998 | 1.047 |  |  |
| -0.211999999999998 | 1.046 |  |  |
| -0.209999999999998 | 1.045 |  |  |
| -0.207999999999998 | 1.044 |  |  |
| -0.205999999999998 | 1.043 |  |  |
| -0.203999999999998 | 1.042 |  |  |
| -0.201999999999998 | 1.042 |  |  |
| -0.199999999999998 | 1.041 |  |  |
| -0.197999999999998 | 1.04 |  |  |
| -0.195999999999998 | 1.039 |  |  |
| -0.193999999999998 | 1.038 |  |  |
| -0.191999999999998 | 1.038 |  |  |
| -0.189999999999998 | 1.037 |  |  |
| -0.187999999999998 | 1.036 |  |  |
| -0.185999999999998 | 1.035 |  |  |
| -0.183999999999998 | 1.034 |  |  |
| -0.181999999999998 | 1.034 |  |  |
| -0.179999999999998 | 1.033 |  |  |
| -0.177999999999998 | 1.032 |  |  |
| -0.175999999999998 | 1.031 |  |  |
| -0.173999999999998 | 1.031 |  |  |
| -0.171999999999998 | 1.03 |  |  |
| -0.169999999999998 | 1.029 |  |  |
| -0.167999999999998 | 1.029 |  |  |
| -0.165999999999998 | 1.028 |  |  |
| -0.163999999999998 | 1.027 |  |  |
| -0.161999999999998 | 1.027 |  |  |
| -0.159999999999998 | 1.026 |  |  |
| -0.157999999999998 | 1.025 |  |  |
| -0.155999999999998 | 1.025 |  |  |
| -0.153999999999998 | 1.024 |  |  |
| -0.151999999999998 | 1.023 |  |  |
| -0.149999999999998 | 1.023 |  |  |
| -0.147999999999998 | 1.022 |  |  |
| -0.145999999999998 | 1.022 |  |  |
| -0.143999999999998 | 1.021 |  |  |
| -0.141999999999998 | 1.02 |  |  |
| -0.139999999999998 | 1.02 |  |  |
| -0.137999999999998 | 1.019 |  |  |
| -0.135999999999998 | 1.019 |  |  |
| -0.133999999999998 | 1.018 |  |  |
| -0.131999999999998 | 1.018 |  |  |
| -0.129999999999998 | 1.017 |  |  |
| -0.127999999999998 | 1.017 |  |  |
| -0.125999999999998 | 1.016 |  |  |
| -0.123999999999998 | 1.015 |  |  |
| -0.121999999999998 | 1.015 |  |  |
| -0.119999999999998 | 1.015 |  |  |
| -0.117999999999998 | 1.014 |  |  |
| -0.115999999999998 | 1.014 |  |  |
| -0.113999999999998 | 1.013 |  |  |
| -0.111999999999998 | 1.013 |  |  |
| -0.109999999999998 | 1.012 |  |  |
| -0.107999999999998 | 1.012 |  |  |
| -0.105999999999998 | 1.011 |  |  |
| -0.103999999999998 | 1.011 |  |  |
| -0.101999999999998 | 1.01 |  |  |
| -0.0999999999999983 | 1.01 |  |  |
| -0.0979999999999983 | 1.01 |  |  |
| -0.0959999999999983 | 1.009 |  |  |
| -0.0939999999999983 | 1.009 |  |  |
| -0.0919999999999983 | 1.008 |  |  |
| -0.0899999999999983 | 1.008 |  |  |
| -0.0879999999999983 | 1.008 |  |  |
| -0.0859999999999983 | 1.007 |  |  |
| -0.0839999999999983 | 1.007 |  |  |
| -0.0819999999999983 | 1.007 |  |  |
| -0.0799999999999983 | 1.006 |  |  |
| -0.0779999999999983 | 1.006 |  |  |
| -0.0759999999999983 | 1.006 |  |  |
| -0.0739999999999983 | 1.005 |  |  |
| -0.0719999999999983 | 1.005 |  |  |
| -0.0699999999999983 | 1.005 |  |  |
| -0.0679999999999983 | 1.005 |  |  |
| -0.0659999999999983 | 1.004 |  |  |
| -0.0639999999999983 | 1.004 |  |  |
| -0.0619999999999983 | 1.004 |  |  |
| -0.0599999999999983 | 1.004 |  |  |
| -0.0579999999999983 | 1.003 |  |  |
| -0.0559999999999983 | 1.003 |  |  |
| -0.0539999999999983 | 1.003 |  |  |
| -0.0519999999999983 | 1.003 |  |  |
| -0.0499999999999983 | 1.003 |  |  |
| -0.0479999999999983 | 1.002 |  |  |
| -0.0459999999999983 | 1.002 |  |  |
| -0.0439999999999983 | 1.002 |  |  |
| -0.0419999999999983 | 1.002 |  |  |
| -0.0399999999999983 | 1.002 |  |  |
| -0.0379999999999982 | 1.001 |  |  |
| -0.0359999999999982 | 1.001 |  |  |
| -0.0339999999999982 | 1.001 |  |  |
| -0.0319999999999982 | 1.001 |  |  |
| -0.0299999999999982 | 1.001 |  |  |
| -0.0279999999999982 | 1.001 |  |  |
| -0.0259999999999982 | 1.001 |  |  |
| -0.0239999999999982 | 1.001 |  |  |
| -0.0219999999999982 | 1 |  |  |
| -0.0199999999999982 | 1 |  |  |
| -0.0179999999999982 | 1 |  |  |
| -0.0159999999999982 | 1 |  |  |
| -0.0139999999999982 | 1 |  |  |
| -0.0119999999999982 | 1 |  |  |
| -0.00999999999999823 | 1 |  |  |
| -0.00799999999999824 | 1 |  |  |
| -0.00599999999999824 | 1 |  |  |
| -0.00399999999999824 | 1 |  |  |
| -0.00199999999999824 | 1 |  |  |
| 1.76247905159244e-15 | 1 |  |  |
| 0.00200000000000176 | 1 |  |  |
| 0.00400000000000176 | 1 |  |  |
| 0.00600000000000176 | 1 |  |  |
| 0.00800000000000176 | 1 |  |  |
| 0.0100000000000018 | 1 |  |  |
| 0.0120000000000018 | 1 |  |  |
| 0.0140000000000018 | 1 |  |  |
| 0.0160000000000018 | 1 |  |  |
| 0.0180000000000018 | 1 |  |  |
| 0.0200000000000018 | 1 |  |  |
| 0.0220000000000018 | 1 |  |  |
| 0.0240000000000018 | 1.001 |  |  |
| 0.0260000000000018 | 1.001 |  |  |
| 0.0280000000000018 | 1.001 |  |  |
| 0.0300000000000018 | 1.001 |  |  |
| 0.0320000000000018 | 1.001 |  |  |
| 0.0340000000000018 | 1.001 |  |  |
| 0.0360000000000018 | 1.001 |  |  |
| 0.0380000000000018 | 1.001 |  |  |
| 0.0400000000000018 | 1.002 |  |  |
| 0.0420000000000018 | 1.002 |  |  |
| 0.0440000000000018 | 1.002 |  |  |
| 0.0460000000000018 | 1.002 |  |  |
| 0.0480000000000018 | 1.002 |  |  |
| 0.0500000000000018 | 1.003 |  |  |
| 0.0520000000000018 | 1.003 |  |  |
| 0.0540000000000018 | 1.003 |  |  |
| 0.0560000000000018 | 1.003 |  |  |
| 0.0580000000000018 | 1.003 |  |  |
| 0.0600000000000018 | 1.004 |  |  |
| 0.0620000000000018 | 1.004 |  |  |
| 0.0640000000000018 | 1.004 |  |  |
| 0.0660000000000018 | 1.004 |  |  |
| 0.0680000000000018 | 1.005 |  |  |
| 0.0700000000000018 | 1.005 |  |  |
| 0.0720000000000018 | 1.005 |  |  |
| 0.0740000000000018 | 1.005 |  |  |
| 0.0760000000000018 | 1.006 |  |  |
| 0.0780000000000018 | 1.006 |  |  |
| 0.0800000000000018 | 1.006 |  |  |
| 0.0820000000000018 | 1.007 |  |  |
| 0.0840000000000018 | 1.007 |  |  |
| 0.0860000000000018 | 1.007 |  |  |
| 0.0880000000000018 | 1.008 |  |  |
| 0.0900000000000018 | 1.008 |  |  |
| 0.0920000000000018 | 1.008 |  |  |
| 0.0940000000000018 | 1.009 |  |  |
| 0.0960000000000018 | 1.009 |  |  |
| 0.0980000000000018 | 1.01 |  |  |
| 0.100000000000002 | 1.01 |  |  |
| 0.102000000000002 | 1.01 |  |  |
| 0.104000000000002 | 1.011 |  |  |
| 0.106000000000002 | 1.011 |  |  |
| 0.108000000000002 | 1.012 |  |  |
| 0.110000000000002 | 1.012 |  |  |
| 0.112000000000002 | 1.013 |  |  |
| 0.114000000000002 | 1.013 |  |  |
| 0.116000000000002 | 1.014 |  |  |
| 0.118000000000002 | 1.014 |  |  |
| 0.120000000000002 | 1.015 |  |  |
| 0.122000000000002 | 1.015 |  |  |
| 0.124000000000002 | 1.015 |  |  |
| 0.126000000000002 | 1.016 |  |  |
| 0.128000000000002 | 1.017 |  |  |
| 0.130000000000002 | 1.017 |  |  |
| 0.132000000000002 | 1.018 |  |  |
| 0.134000000000002 | 1.018 |  |  |
| 0.136000000000002 | 1.019 |  |  |
| 0.138000000000002 | 1.019 |  |  |
| 0.140000000000002 | 1.02 |  |  |
| 0.142000000000002 | 1.02 |  |  |
| 0.144000000000002 | 1.021 |  |  |
| 0.146000000000002 | 1.022 |  |  |
| 0.148000000000002 | 1.022 |  |  |
| 0.150000000000002 | 1.023 |  |  |
| 0.152000000000002 | 1.023 |  |  |
| 0.154000000000002 | 1.024 |  |  |
| 0.156000000000002 | 1.025 |  |  |
| 0.158000000000002 | 1.025 |  |  |
| 0.160000000000002 | 1.026 |  |  |
| 0.162000000000002 | 1.027 |  |  |
| 0.164000000000002 | 1.027 |  |  |
| 0.166000000000002 | 1.028 |  |  |
| 0.168000000000002 | 1.029 |  |  |
| 0.170000000000002 | 1.029 |  |  |
| 0.172000000000002 | 1.03 |  |  |
| 0.174000000000002 | 1.031 |  |  |
| 0.176000000000002 | 1.031 |  |  |
| 0.178000000000002 | 1.032 |  |  |
| 0.180000000000002 | 1.033 |  |  |
| 0.182000000000002 | 1.034 |  |  |
| 0.184000000000002 | 1.034 |  |  |
| 0.186000000000002 | 1.035 |  |  |
| 0.188000000000002 | 1.036 |  |  |
| 0.190000000000002 | 1.037 |  |  |
| 0.192000000000002 | 1.038 |  |  |
| 0.194000000000002 | 1.038 |  |  |
| 0.196000000000002 | 1.039 |  |  |
| 0.198000000000002 | 1.04 |  |  |
| 0.200000000000002 | 1.041 |  |  |
| 0.202000000000002 | 1.042 |  |  |
| 0.204000000000002 | 1.042 |  |  |
| 0.206000000000002 | 1.043 |  |  |
| 0.208000000000002 | 1.044 |  |  |
| 0.210000000000002 | 1.045 |  |  |
| 0.212000000000002 | 1.046 |  |  |
| 0.214000000000002 | 1.047 |  |  |
| 0.216000000000002 | 1.048 |  |  |
| 0.218000000000002 | 1.049 |  |  |
| 0.220000000000002 | 1.05 |  |  |
| 0.222000000000002 | 1.051 |  |  |
| 0.224000000000002 | 1.051 |  |  |
| 0.226000000000002 | 1.052 |  |  |
| 0.228000000000002 | 1.053 |  |  |
| 0.230000000000002 | 1.054 |  |  |
| 0.232000000000002 | 1.055 |  |  |
| 0.234000000000002 | 1.056 |  |  |
| 0.236000000000002 | 1.057 |  |  |
| 0.238000000000002 | 1.058 |  |  |
| 0.240000000000002 | 1.059 |  |  |
| 0.242000000000002 | 1.06 |  |  |
| 0.244000000000002 | 1.061 |  |  |
| 0.246000000000002 | 1.062 |  |  |
| 0.248000000000002 | 1.063 |  |  |
| 0.250000000000002 | 1.064 |  |  |
| 0.252000000000002 | 1.066 |  |  |
| 0.254000000000002 | 1.067 |  |  |
| 0.256000000000002 | 1.068 |  |  |
| 0.258000000000002 | 1.069 |  |  |
| 0.260000000000002 | 1.07 |  |  |
| 0.262000000000002 | 1.071 |  |  |
| 0.264000000000002 | 1.072 |  |  |
| 0.266000000000002 | 1.073 |  |  |
| 0.268000000000002 | 1.074 |  |  |
| 0.270000000000002 | 1.076 |  |  |
| 0.272000000000002 | 1.077 |  |  |
| 0.274000000000002 | 1.078 |  |  |
| 0.276000000000002 | 1.079 |  |  |
| 0.278000000000002 | 1.08 |  |  |
| 0.280000000000002 | 1.082 |  |  |
| 0.282000000000002 | 1.083 |  |  |
| 0.284000000000002 | 1.084 |  |  |
| 0.286000000000002 | 1.085 |  |  |
| 0.288000000000002 | 1.086 |  |  |
| 0.290000000000002 | 1.088 |  |  |
| 0.292000000000002 | 1.089 |  |  |
| 0.294000000000002 | 1.09 |  |  |
| 0.296000000000002 | 1.092 |  |  |
| 0.298000000000002 | 1.093 |  |  |
| 0.300000000000002 | 1.094 |  |  |
| 0.302000000000002 | 1.095 |  |  |
| 0.304000000000002 | 1.097 |  |  |
| 0.306000000000002 | 1.098 |  |  |
| 0.308000000000002 | 1.1 |  |  |
| 0.310000000000002 | 1.101 |  |  |
| 0.312000000000002 | 1.102 |  |  |
| 0.314000000000002 | 1.104 |  |  |
| 0.316000000000002 | 1.105 |  |  |
| 0.318000000000002 | 1.106 |  |  |
| 0.320000000000002 | 1.108 |  |  |
| 0.322000000000002 | 1.109 |  |  |
| 0.324000000000002 | 1.111 |  |  |
| 0.326000000000002 | 1.112 |  |  |
| 0.328000000000002 | 1.114 |  |  |
| 0.330000000000002 | 1.115 |  |  |
| 0.332000000000002 | 1.117 |  |  |
| 0.334000000000002 | 1.118 |  |  |
| 0.336000000000002 | 1.12 |  |  |
| 0.338000000000002 | 1.121 |  |  |
| 0.340000000000002 | 1.123 |  |  |
| 0.342000000000002 | 1.124 |  |  |
| 0.344000000000002 | 1.126 |  |  |
| 0.346000000000002 | 1.127 |  |  |
| 0.348000000000002 | 1.129 |  |  |
| 0.350000000000002 | 1.13 |  |  |
| 0.352000000000002 | 1.132 |  |  |
| 0.354000000000002 | 1.134 |  |  |
| 0.356000000000002 | 1.135 |  |  |
| 0.358000000000002 | 1.137 |  |  |
| 0.360000000000002 | 1.138 |  |  |
| 0.362000000000002 | 1.14 |  |  |
| 0.364000000000002 | 1.142 |  |  |
| 0.366000000000002 | 1.143 |  |  |
| 0.368000000000002 | 1.145 |  |  |
| 0.370000000000002 | 1.147 |  |  |
| 0.372000000000002 | 1.148 |  |  |
| 0.374000000000002 | 1.15 |  |  |
| 0.376000000000002 | 1.152 |  |  |
| 0.378000000000002 | 1.154 |  |  |
| 0.380000000000002 | 1.155 |  |  |
| 0.382000000000002 | 1.157 |  |  |
| 0.384000000000002 | 1.159 |  |  |
| 0.386000000000002 | 1.161 |  |  |
| 0.388000000000002 | 1.162 |  |  |
| 0.390000000000002 | 1.164 |  |  |
| 0.392000000000002 | 1.166 |  |  |
| 0.394000000000002 | 1.168 |  |  |
| 0.396000000000002 | 1.17 |  |  |
| 0.398000000000002 | 1.172 |  |  |
| 0.400000000000002 | 1.174 |  |  |
| 0.402000000000002 | 1.175 |  |  |
| 0.404000000000002 | 1.177 |  |  |
| 0.406000000000002 | 1.179 |  |  |
| 0.408000000000002 | 1.181 |  |  |
| 0.410000000000002 | 1.183 |  |  |
| 0.412000000000002 | 1.185 |  |  |
| 0.414000000000002 | 1.187 |  |  |
| 0.416000000000002 | 1.189 |  |  |
| 0.418000000000002 | 1.191 |  |  |
| 0.420000000000002 | 1.193 |  |  |
| 0.422000000000002 | 1.195 |  |  |
| 0.424000000000002 | 1.197 |  |  |
| 0.426000000000002 | 1.199 |  |  |
| 0.428000000000002 | 1.201 |  |  |
| 0.430000000000002 | 1.203 |  |  |
| 0.432000000000002 | 1.205 |  |  |
| 0.434000000000002 | 1.207 |  |  |
| 0.436000000000002 | 1.209 |  |  |
| 0.438000000000002 | 1.211 |  |  |
| 0.440000000000002 | 1.214 |  |  |
| 0.442000000000002 | 1.216 |  |  |
| 0.444000000000002 | 1.218 |  |  |
| 0.446000000000002 | 1.22 |  |  |
| 0.448000000000002 | 1.222 |  |  |
| 0.450000000000002 | 1.224 |  |  |
| 0.452000000000002 | 1.227 |  |  |
| 0.454000000000002 | 1.229 |  |  |
| 0.456000000000002 | 1.231 |  |  |
| 0.458000000000002 | 1.233 |  |  |
| 0.460000000000002 | 1.236 |  |  |
| 0.462000000000002 | 1.238 |  |  |
| 0.464000000000002 | 1.24 |  |  |
| 0.466000000000002 | 1.243 |  |  |
| 0.468000000000002 | 1.245 |  |  |
| 0.470000000000002 | 1.247 |  |  |
| 0.472000000000002 | 1.25 |  |  |
| 0.474000000000002 | 1.252 |  |  |
| 0.476000000000002 | 1.254 |  |  |
| 0.478000000000002 | 1.257 |  |  |
| 0.480000000000002 | 1.259 |  |  |
| 0.482000000000002 | 1.262 |  |  |
| 0.484000000000002 | 1.264 |  |  |
| 0.486000000000002 | 1.266 |  |  |
| 0.488000000000002 | 1.269 |  |  |
| 0.490000000000002 | 1.271 |  |  |
| 0.492000000000002 | 1.274 |  |  |
| 0.494000000000002 | 1.276 |  |  |
| 0.496000000000002 | 1.279 |  |  |
| 0.498000000000002 | 1.281 |  |  |
| 0.500000000000002 | 1.284 |  |  |
| 0.502000000000002 | 1.287 |  |  |
| 0.504000000000002 | 1.289 |  |  |
| 0.506000000000002 | 1.292 |  |  |
| 0.508000000000002 | 1.294 |  |  |
| 0.510000000000002 | 1.297 |  |  |
| 0.512000000000002 | 1.3 |  |  |
| 0.514000000000002 | 1.302 |  |  |
| 0.516000000000002 | 1.305 |  |  |
| 0.518000000000002 | 1.308 |  |  |
| 0.520000000000002 | 1.31 |  |  |
| 0.522000000000002 | 1.313 |  |  |
| 0.524000000000002 | 1.316 |  |  |
| 0.526000000000002 | 1.319 |  |  |
| 0.528000000000002 | 1.322 |  |  |
| 0.530000000000002 | 1.324 |  |  |
| 0.532000000000002 | 1.327 |  |  |
| 0.534000000000002 | 1.33 |  |  |
| 0.536000000000002 | 1.333 |  |  |
| 0.538000000000002 | 1.336 |  |  |
| 0.540000000000002 | 1.339 |  |  |
| 0.542000000000002 | 1.341 |  |  |
| 0.544000000000002 | 1.344 |  |  |
| 0.546000000000002 | 1.347 |  |  |
| 0.548000000000002 | 1.35 |  |  |
| 0.550000000000002 | 1.353 |  |  |
| 0.552000000000002 | 1.356 |  |  |
| 0.554000000000002 | 1.359 |  |  |
| 0.556000000000002 | 1.362 |  |  |
| 0.558000000000002 | 1.365 |  |  |
| 0.560000000000002 | 1.368 |  |  |
| 0.562000000000002 | 1.371 |  |  |
| 0.564000000000002 | 1.375 |  |  |
| 0.566000000000002 | 1.378 |  |  |
| 0.568000000000002 | 1.381 |  |  |
| 0.570000000000002 | 1.384 |  |  |
| 0.572000000000002 | 1.387 |  |  |
| 0.574000000000002 | 1.39 |  |  |
| 0.576000000000002 | 1.393 |  |  |
| 0.578000000000002 | 1.397 |  |  |
| 0.580000000000002 | 1.4 |  |  |
| 0.582000000000002 | 1.403 |  |  |
| 0.584000000000002 | 1.406 |  |  |
| 0.586000000000002 | 1.41 |  |  |
| 0.588000000000002 | 1.413 |  |  |
| 0.590000000000002 | 1.416 |  |  |
| 0.592000000000002 | 1.42 |  |  |
| 0.594000000000002 | 1.423 |  |  |
| 0.596000000000002 | 1.426 |  |  |
| 0.598000000000002 | 1.43 |  |  |
| 0.600000000000002 | 1.433 |  |  |
| 0.602000000000002 | 1.437 |  |  |
| 0.604000000000002 | 1.44 |  |  |
| 0.606000000000002 | 1.444 |  |  |
| 0.608000000000002 | 1.447 |  |  |
| 0.610000000000002 | 1.451 |  |  |
| 0.612000000000002 | 1.454 |  |  |
| 0.614000000000002 | 1.458 |  |  |
| 0.616000000000002 | 1.461 |  |  |
| 0.618000000000002 | 1.465 |  |  |
| 0.620000000000002 | 1.469 |  |  |
| 0.622000000000002 | 1.472 |  |  |
| 0.624000000000002 | 1.476 |  |  |
| 0.626000000000002 | 1.48 |  |  |
| 0.628000000000002 | 1.483 |  |  |
| 0.630000000000002 | 1.487 |  |  |
| 0.632000000000002 | 1.491 |  |  |
| 0.634000000000002 | 1.495 |  |  |
| 0.636000000000002 | 1.499 |  |  |
| 0.638000000000002 | 1.502 |  |  |
| 0.640000000000002 | 1.506 |  |  |
| 0.642000000000002 | 1.51 |  |  |
| 0.644000000000002 | 1.514 |  |  |
| 0.646000000000002 | 1.518 |  |  |
| 0.648000000000002 | 1.522 |  |  |
| 0.650000000000002 | 1.526 |  |  |
| 0.652000000000002 | 1.53 |  |  |
| 0.654000000000002 | 1.534 |  |  |
| 0.656000000000002 | 1.538 |  |  |
| 0.658000000000002 | 1.542 |  |  |
| 0.660000000000002 | 1.546 |  |  |
| 0.662000000000002 | 1.55 |  |  |
| 0.664000000000002 | 1.554 |  |  |
| 0.666000000000002 | 1.558 |  |  |
| 0.668000000000002 | 1.562 |  |  |
| 0.670000000000002 | 1.567 |  |  |
| 0.672000000000002 | 1.571 |  |  |
| 0.674000000000002 | 1.575 |  |  |
| 0.676000000000002 | 1.579 |  |  |
| 0.678000000000002 | 1.584 |  |  |
| 0.680000000000002 | 1.588 |  |  |
| 0.682000000000002 | 1.592 |  |  |
| 0.684000000000002 | 1.597 |  |  |
| 0.686000000000002 | 1.601 |  |  |
| 0.688000000000002 | 1.605 |  |  |
| 0.690000000000002 | 1.61 |  |  |
| 0.692000000000002 | 1.614 |  |  |
| 0.694000000000002 | 1.619 |  |  |
| 0.696000000000002 | 1.623 |  |  |
| 0.698000000000002 | 1.628 |  |  |
| 0.700000000000002 | 1.632 |  |  |
| 0.702000000000002 | 1.637 |  |  |
| 0.704000000000002 | 1.642 |  |  |
| 0.706000000000002 | 1.646 |  |  |
| 0.708000000000002 | 1.651 |  |  |
| 0.710000000000002 | 1.655 |  |  |
| 0.712000000000002 | 1.66 |  |  |
| 0.714000000000002 | 1.665 |  |  |
| 0.716000000000002 | 1.67 |  |  |
| 0.718000000000002 | 1.675 |  |  |
| 0.720000000000002 | 1.679 |  |  |
| 0.722000000000002 | 1.684 |  |  |
| 0.724000000000002 | 1.689 |  |  |
| 0.726000000000002 | 1.694 |  |  |
| 0.728000000000002 | 1.699 |  |  |
| 0.730000000000002 | 1.704 |  |  |
| 0.732000000000002 | 1.709 |  |  |
| 0.734000000000002 | 1.714 |  |  |
| 0.736000000000002 | 1.719 |  |  |
| 0.738000000000002 | 1.724 |  |  |
| 0.740000000000002 | 1.729 |  |  |
| 0.742000000000002 | 1.734 |  |  |
| 0.744000000000002 | 1.739 |  |  |
| 0.746000000000002 | 1.745 |  |  |
| 0.748000000000002 | 1.75 |  |  |
| 0.750000000000002 | 1.755 |  |  |
| 0.752000000000002 | 1.76 |  |  |
| 0.754000000000002 | 1.766 |  |  |
| 0.756000000000002 | 1.771 |  |  |
| 0.758000000000002 | 1.776 |  |  |
| 0.760000000000002 | 1.782 |  |  |
| 0.762000000000002 | 1.787 |  |  |
| 0.764000000000002 | 1.793 |  |  |
| 0.766000000000002 | 1.798 |  |  |
| 0.768000000000002 | 1.804 |  |  |
| 0.770000000000002 | 1.809 |  |  |
| 0.772000000000002 | 1.815 |  |  |
| 0.774000000000002 | 1.82 |  |  |
| 0.776000000000002 | 1.826 |  |  |
| 0.778000000000002 | 1.832 |  |  |
| 0.780000000000002 | 1.837 |  |  |
| 0.782000000000002 | 1.843 |  |  |
| 0.784000000000002 | 1.849 |  |  |
| 0.786000000000002 | 1.855 |  |  |
| 0.788000000000002 | 1.861 |  |  |
| 0.790000000000002 | 1.867 |  |  |
| 0.792000000000002 | 1.872 |  |  |
| 0.794000000000002 | 1.878 |  |  |
| 0.796000000000002 | 1.884 |  |  |
| 0.798000000000002 | 1.89 |  |  |
| 0.800000000000002 | 1.896 |  |  |
| 0.802000000000002 | 1.903 |  |  |
| 0.804000000000002 | 1.909 |  |  |
| 0.806000000000002 | 1.915 |  |  |
| 0.808000000000002 | 1.921 |  |  |
| 0.810000000000002 | 1.927 |  |  |
| 0.812000000000002 | 1.934 |  |  |
| 0.814000000000002 | 1.94 |  |  |
| 0.816000000000002 | 1.946 |  |  |
| 0.818000000000002 | 1.953 |  |  |
| 0.820000000000002 | 1.959 |  |  |
| 0.822000000000002 | 1.965 |  |  |
| 0.824000000000002 | 1.972 |  |  |
| 0.826000000000002 | 1.978 |  |  |
| 0.828000000000002 | 1.985 |  |  |
| 0.830000000000002 | 1.992 |  |  |
| 0.832000000000002 | 1.998 |  |  |
| 0.834000000000002 | 2.005 |  |  |
| 0.836000000000002 | 2.012 |  |  |
| 0.838000000000002 | 2.018 |  |  |
| 0.840000000000002 | 2.025 |  |  |
| 0.842000000000002 | 2.032 |  |  |
| 0.844000000000002 | 2.039 |  |  |
| 0.846000000000002 | 2.046 |  |  |
| 0.848000000000002 | 2.053 |  |  |
| 0.850000000000002 | 2.06 |  |  |
| 0.852000000000002 | 2.067 |  |  |
| 0.854000000000002 | 2.074 |  |  |
| 0.856000000000002 | 2.081 |  |  |
| 0.858000000000002 | 2.088 |  |  |
| 0.860000000000002 | 2.095 |  |  |
| 0.862000000000002 | 2.102 |  |  |
| 0.864000000000002 | 2.11 |  |  |
| 0.866000000000002 | 2.117 |  |  |
| 0.868000000000002 | 2.124 |  |  |
| 0.870000000000002 | 2.132 |  |  |
| 0.872000000000002 | 2.139 |  |  |
| 0.874000000000002 | 2.147 |  |  |
| 0.876000000000002 | 2.154 |  |  |
| 0.878000000000002 | 2.162 |  |  |
| 0.880000000000002 | 2.169 |  |  |
| 0.882000000000002 | 2.177 |  |  |
| 0.884000000000002 | 2.185 |  |  |
| 0.886000000000002 | 2.192 |  |  |
| 0.888000000000002 | 2.2 |  |  |
| 0.890000000000002 | 2.208 |  |  |
| 0.892000000000002 | 2.216 |  |  |
| 0.894000000000002 | 2.224 |  |  |
| 0.896000000000002 | 2.232 |  |  |
| 0.898000000000002 | 2.24 |  |  |
| 0.900000000000002 | 2.248 |  |  |
| 0.902000000000002 | 2.256 |  |  |
| 0.904000000000002 | 2.264 |  |  |
| 0.906000000000002 | 2.272 |  |  |
| 0.908000000000002 | 2.281 |  |  |
| 0.910000000000002 | 2.289 |  |  |
| 0.912000000000002 | 2.297 |  |  |
| 0.914000000000002 | 2.306 |  |  |
| 0.916000000000002 | 2.314 |  |  |
| 0.918000000000002 | 2.323 |  |  |
| 0.920000000000002 | 2.331 |  |  |
| 0.922000000000002 | 2.34 |  |  |
| 0.924000000000002 | 2.348 |  |  |
| 0.926000000000002 | 2.357 |  |  |
| 0.928000000000002 | 2.366 |  |  |
| 0.930000000000002 | 2.375 |  |  |
| 0.932000000000002 | 2.384 |  |  |
| 0.934000000000002 | 2.393 |  |  |
| 0.936000000000002 | 2.402 |  |  |
| 0.938000000000002 | 2.411 |  |  |
| 0.940000000000002 | 2.42 |  |  |
| 0.942000000000002 | 2.429 |  |  |
| 0.944000000000002 | 2.438 |  |  |
| 0.946000000000002 | 2.447 |  |  |
| 0.948000000000002 | 2.456 |  |  |
| 0.950000000000002 | 2.466 |  |  |
| 0.952000000000002 | 2.475 |  |  |
| 0.954000000000002 | 2.485 |  |  |
| 0.956000000000002 | 2.494 |  |  |
| 0.958000000000002 | 2.504 |  |  |
| 0.960000000000002 | 2.513 |  |  |
| 0.962000000000002 | 2.523 |  |  |
| 0.964000000000002 | 2.533 |  |  |
| 0.966000000000002 | 2.543 |  |  |
| 0.968000000000002 | 2.552 |  |  |
| 0.970000000000002 | 2.562 |  |  |
| 0.972000000000002 | 2.572 |  |  |
| 0.974000000000003 | 2.582 |  |  |
| 0.976000000000003 | 2.592 |  |  |
| 0.978000000000003 | 2.603 |  |  |
| 0.980000000000002 | 2.613 |  |  |
| 0.982000000000002 | 2.623 |  |  |
| 0.984000000000003 | 2.633 |  |  |
| 0.986000000000003 | 2.644 |  |  |
| 0.988000000000003 | 2.654 |  |  |
| 0.990000000000002 | 2.665 |  |  |
| 0.992000000000002 | 2.675 |  |  |
| 0.994000000000003 | 2.686 |  |  |
| 0.996000000000003 | 2.697 |  |  |
| 0.998000000000003 | 2.707 |  |  |
| 1.000000000000002 | 2.718 |  |  |
| 1.002000000000002 | 2.729 |  |  |
| 1.004000000000002 | 2.74 |  |  |
| 1.006000000000002 | 2.751 |  |  |
| 1.008000000000002 | 2.762 |  |  |
| 1.010000000000002 | 2.773 |  |  |
| 1.012000000000002 | 2.785 |  |  |
| 1.014000000000002 | 2.796 |  |  |
| 1.016000000000002 | 2.807 |  |  |
| 1.018000000000002 | 2.819 |  |  |
| 1.020000000000002 | 2.83 |  |  |
| 1.022000000000002 | 2.842 |  |  |
| 1.024000000000002 | 2.854 |  |  |
| 1.026000000000002 | 2.865 |  |  |
| 1.028000000000002 | 2.877 |  |  |
| 1.030000000000002 | 2.889 |  |  |
| 1.032000000000002 | 2.901 |  |  |
| 1.034000000000002 | 2.913 |  |  |
| 1.036000000000002 | 2.925 |  |  |
| 1.038000000000002 | 2.937 |  |  |
| 1.040000000000002 | 2.949 |  |  |
| 1.042000000000002 | 2.962 |  |  |
| 1.044000000000002 | 2.974 |  |  |
| 1.046000000000002 | 2.987 |  |  |
| 1.048000000000002 | 2.999 |  |  |
| 1.050000000000002 | 3.012 |  |  |
| 1.052000000000002 | 3.024 |  |  |
| 1.054000000000002 | 3.037 |  |  |
| 1.056000000000002 | 3.05 |  |  |
| 1.058000000000002 | 3.063 |  |  |
| 1.060000000000002 | 3.076 |  |  |
| 1.062000000000002 | 3.089 |  |  |
| 1.064000000000002 | 3.102 |  |  |
| 1.066000000000002 | 3.115 |  |  |
| 1.068000000000002 | 3.129 |  |  |
| 1.070000000000002 | 3.142 |  |  |
| 1.072000000000002 | 3.156 |  |  |
| 1.074000000000003 | 3.169 |  |  |
| 1.076000000000003 | 3.183 |  |  |
| 1.078000000000003 | 3.197 |  |  |
| 1.080000000000002 | 3.21 |  |  |
| 1.082000000000002 | 3.224 |  |  |
| 1.084000000000003 | 3.238 |  |  |
| 1.086000000000003 | 3.252 |  |  |
| 1.088000000000003 | 3.267 |  |  |
| 1.090000000000002 | 3.281 |  |  |
| 1.092000000000002 | 3.295 |  |  |
| 1.094000000000003 | 3.31 |  |  |
| 1.096000000000003 | 3.324 |  |  |
| 1.098000000000003 | 3.339 |  |  |
| 1.100000000000003 | 3.353 |  |  |
| 1.102000000000003 | 3.368 |  |  |
| 1.104000000000003 | 3.383 |  |  |
| 1.106000000000003 | 3.398 |  |  |
| 1.108000000000003 | 3.413 |  |  |
| 1.110000000000003 | 3.428 |  |  |
| 1.112000000000003 | 3.444 |  |  |
| 1.114000000000003 | 3.459 |  |  |
| 1.116000000000003 | 3.475 |  |  |
| 1.118000000000003 | 3.49 |  |  |
| 1.120000000000003 | 3.506 |  |  |
| 1.122000000000003 | 3.521 |  |  |
| 1.124000000000003 | 3.537 |  |  |
| 1.126000000000003 | 3.553 |  |  |
| 1.128000000000003 | 3.569 |  |  |
| 1.130000000000003 | 3.586 |  |  |
| 1.132000000000003 | 3.602 |  |  |
| 1.134000000000003 | 3.618 |  |  |
| 1.136000000000003 | 3.635 |  |  |
| 1.138000000000003 | 3.651 |  |  |
| 1.140000000000003 | 3.668 |  |  |
| 1.142000000000003 | 3.685 |  |  |
| 1.144000000000003 | 3.701 |  |  |
| 1.146000000000003 | 3.718 |  |  |
| 1.148000000000003 | 3.736 |  |  |
| 1.150000000000003 | 3.753 |  |  |
| 1.152000000000003 | 3.77 |  |  |
| 1.154000000000003 | 3.788 |  |  |
| 1.156000000000003 | 3.805 |  |  |
| 1.158000000000003 | 3.823 |  |  |
| 1.160000000000003 | 3.84 |  |  |
| 1.162000000000003 | 3.858 |  |  |
| 1.164000000000003 | 3.876 |  |  |
| 1.166000000000003 | 3.894 |  |  |
| 1.168000000000003 | 3.913 |  |  |
| 1.170000000000003 | 3.931 |  |  |
| 1.172000000000003 | 3.949 |  |  |
| 1.174000000000003 | 3.968 |  |  |
| 1.176000000000003 | 3.987 |  |  |
| 1.178000000000003 | 4.006 |  |  |
| 1.180000000000003 | 4.024 |  |  |
| 1.182000000000003 | 4.044 |  |  |
| 1.184000000000003 | 4.063 |  |  |
| 1.186000000000003 | 4.082 |  |  |
| 1.188000000000003 | 4.101 |  |  |
| 1.190000000000003 | 4.121 |  |  |
| 1.192000000000003 | 4.141 |  |  |
| 1.194000000000003 | 4.161 |  |  |
| 1.196000000000003 | 4.18 |  |  |
| 1.198000000000003 | 4.201 |  |  |
| 1.200000000000003 | 4.221 |  |  |
| 1.202000000000003 | 4.241 |  |  |
| 1.204000000000003 | 4.261 |  |  |
| 1.206000000000003 | 4.282 |  |  |
| 1.208000000000003 | 4.303 |  |  |
| 1.210000000000003 | 4.324 |  |  |
| 1.212000000000003 | 4.345 |  |  |
| 1.214000000000003 | 4.366 |  |  |
| 1.216000000000003 | 4.387 |  |  |
| 1.218000000000003 | 4.408 |  |  |
| 1.220000000000003 | 4.43 |  |  |
| 1.222000000000003 | 4.452 |  |  |
| 1.224000000000003 | 4.474 |  |  |
| 1.226000000000003 | 4.495 |  |  |
| 1.228000000000003 | 4.518 |  |  |
| 1.230000000000003 | 4.54 |  |  |
| 1.232000000000003 | 4.562 |  |  |
| 1.234000000000003 | 4.585 |  |  |
| 1.236000000000003 | 4.608 |  |  |
| 1.238000000000003 | 4.63 |  |  |
| 1.240000000000003 | 4.653 |  |  |
| 1.242000000000003 | 4.677 |  |  |
| 1.244000000000003 | 4.7 |  |  |
| 1.246000000000003 | 4.723 |  |  |
| 1.248000000000003 | 4.747 |  |  |
| 1.250000000000003 | 4.771 |  |  |
| 1.252000000000003 | 4.795 |  |  |
| 1.254000000000003 | 4.819 |  |  |
| 1.256000000000003 | 4.843 |  |  |
| 1.258000000000003 | 4.867 |  |  |
| 1.260000000000003 | 4.892 |  |  |
| 1.262000000000003 | 4.917 |  |  |
| 1.264000000000003 | 4.942 |  |  |
| 1.266000000000003 | 4.967 |  |  |
| 1.268000000000003 | 4.992 |  |  |
| 1.270000000000003 | 5.017 |  |  |
| 1.272000000000003 | 5.043 |  |  |
| 1.274000000000003 | 5.069 |  |  |
| 1.276000000000003 | 5.095 |  |  |
| 1.278000000000003 | 5.121 |  |  |
| 1.280000000000003 | 5.147 |  |  |
| 1.282000000000003 | 5.173 |  |  |
| 1.284000000000003 | 5.2 |  |  |
| 1.286000000000003 | 5.227 |  |  |
| 1.288000000000003 | 5.254 |  |  |
| 1.290000000000003 | 5.281 |  |  |
| 1.292000000000003 | 5.308 |  |  |
| 1.294000000000003 | 5.336 |  |  |
| 1.296000000000003 | 5.363 |  |  |
| 1.298000000000003 | 5.391 |  |  |
| 1.300000000000003 | 5.419 |  |  |
| 1.302000000000003 | 5.448 |  |  |
| 1.304000000000003 | 5.476 |  |  |
| 1.306000000000003 | 5.505 |  |  |
| 1.308000000000003 | 5.534 |  |  |
| 1.310000000000003 | 5.563 |  |  |
| 1.312000000000003 | 5.592 |  |  |
| 1.314000000000003 | 5.621 |  |  |
| 1.316000000000003 | 5.651 |  |  |
| 1.318000000000003 | 5.681 |  |  |
| 1.320000000000003 | 5.711 |  |  |
| 1.322000000000003 | 5.741 |  |  |
| 1.324000000000003 | 5.772 |  |  |
| 1.326000000000003 | 5.802 |  |  |
| 1.328000000000003 | 5.833 |  |  |
| 1.330000000000003 | 5.864 |  |  |
| 1.332000000000003 | 5.896 |  |  |
| 1.334000000000003 | 5.927 |  |  |
| 1.336000000000003 | 5.959 |  |  |
| 1.338000000000003 | 5.991 |  |  |
| 1.340000000000003 | 6.023 |  |  |
| 1.342000000000003 | 6.055 |  |  |
| 1.344000000000003 | 6.088 |  |  |
| 1.346000000000003 | 6.121 |  |  |
| 1.348000000000003 | 6.154 |  |  |
| 1.350000000000003 | 6.187 |  |  |
| 1.352000000000003 | 6.221 |  |  |
| 1.354000000000003 | 6.255 |  |  |
| 1.356000000000003 | 6.289 |  |  |
| 1.358000000000003 | 6.323 |  |  |
| 1.360000000000003 | 6.357 |  |  |
| 1.362000000000003 | 6.392 |  |  |
| 1.364000000000003 | 6.427 |  |  |
| 1.366000000000003 | 6.462 |  |  |
| 1.368000000000003 | 6.498 |  |  |
| 1.370000000000003 | 6.533 |  |  |
| 1.372000000000003 | 6.569 |  |  |
| 1.374000000000003 | 6.605 |  |  |
| 1.376000000000003 | 6.642 |  |  |
| 1.378000000000003 | 6.678 |  |  |
| 1.380000000000003 | 6.715 |  |  |
| 1.382000000000003 | 6.753 |  |  |
| 1.384000000000003 | 6.79 |  |  |
| 1.386000000000003 | 6.828 |  |  |
| 1.388000000000003 | 6.866 |  |  |
| 1.390000000000003 | 6.904 |  |  |
| 1.392000000000003 | 6.943 |  |  |
| 1.394000000000003 | 6.981 |  |  |
| 1.396000000000003 | 7.02 |  |  |
| 1.398000000000003 | 7.06 |  |  |
| 1.400000000000003 | 7.099 |  |  |
| 1.402000000000003 | 7.139 |  |  |
| 1.404000000000003 | 7.179 |  |  |
| 1.406000000000003 | 7.22 |  |  |
| 1.408000000000003 | 7.261 |  |  |
| 1.410000000000003 | 7.302 |  |  |
| 1.412000000000003 | 7.343 |  |  |
| 1.414000000000003 | 7.385 |  |  |
| 1.416000000000003 | 7.427 |  |  |
| 1.418000000000003 | 7.469 |  |  |
| 1.420000000000003 | 7.511 |  |  |
| 1.422000000000003 | 7.554 |  |  |
| 1.424000000000003 | 7.597 |  |  |
| 1.426000000000003 | 7.641 |  |  |
| 1.428000000000003 | 7.684 |  |  |
| 1.430000000000003 | 7.728 |  |  |
| 1.432000000000003 | 7.773 |  |  |
| 1.434000000000003 | 7.817 |  |  |
| 1.436000000000003 | 7.862 |  |  |
| 1.438000000000003 | 7.908 |  |  |
| 1.440000000000003 | 7.953 |  |  |
| 1.442000000000003 | 7.999 |  |  |
| 1.444000000000003 | 8.046 |  |  |
| 1.446000000000003 | 8.092 |  |  |
| 1.448000000000003 | 8.139 |  |  |
| 1.450000000000003 | 8.187 |  |  |
| 1.452000000000003 | 8.234 |  |  |
| 1.454000000000003 | 8.282 |  |  |
| 1.456000000000003 | 8.331 |  |  |
| 1.458000000000003 | 8.379 |  |  |
| 1.460000000000003 | 8.428 |  |  |
| 1.462000000000003 | 8.478 |  |  |
| 1.464000000000003 | 8.527 |  |  |
| 1.466000000000003 | 8.578 |  |  |
| 1.468000000000003 | 8.628 |  |  |
| 1.470000000000003 | 8.679 |  |  |
| 1.472000000000003 | 8.73 |  |  |
| 1.474000000000003 | 8.782 |  |  |
| 1.476000000000003 | 8.834 |  |  |
| 1.478000000000003 | 8.886 |  |  |
| 1.480000000000003 | 8.939 |  |  |
| 1.482000000000003 | 8.992 |  |  |
| 1.484000000000003 | 9.045 |  |  |
| 1.486000000000003 | 9.099 |  |  |
| 1.488000000000003 | 9.154 |  |  |
| 1.490000000000003 | 9.208 |  |  |
| 1.492000000000003 | 9.263 |  |  |
| 1.494000000000003 | 9.319 |  |  |
| 1.496000000000003 | 9.375 |  |  |
| 1.498000000000003 | 9.431 |  |  |
| 1.500000000000003 | 9.488 |  |  |
| 1.502000000000003 | 9.545 |  |  |
| 1.504000000000003 | 9.602 |  |  |
| 1.506000000000003 | 9.66 |  |  |
| 1.508000000000003 | 9.719 |  |  |
| 1.510000000000003 | 9.778 |  |  |
| 1.512000000000003 | 9.837 |  |  |
| 1.514000000000003 | 9.897 |  |  |
| 1.516000000000003 | 9.957 |  |  |
| 1.518000000000003 | 10.017 |  |  |
| 1.520000000000003 | 10.078 |  |  |
| 1.522000000000003 | 10.14 |  |  |
| 1.524000000000003 | 10.202 |  |  |
| 1.526000000000003 | 10.264 |  |  |
| 1.528000000000003 | 10.327 |  |  |
| 1.530000000000003 | 10.391 |  |  |
| 1.532000000000003 | 10.454 |  |  |
| 1.534000000000003 | 10.519 |  |  |
| 1.536000000000003 | 10.583 |  |  |
| 1.538000000000003 | 10.649 |  |  |
| 1.540000000000003 | 10.715 |  |  |
| 1.542000000000003 | 10.781 |  |  |
| 1.544000000000003 | 10.848 |  |  |
| 1.546000000000003 | 10.915 |  |  |
| 1.548000000000003 | 10.983 |  |  |
| 1.550000000000003 | 11.051 |  |  |
| 1.552000000000003 | 11.12 |  |  |
| 1.554000000000003 | 11.189 |  |  |
| 1.556000000000003 | 11.259 |  |  |
| 1.558000000000003 | 11.329 |  |  |
| 1.560000000000003 | 11.4 |  |  |
| 1.562000000000003 | 11.471 |  |  |
| 1.564000000000003 | 11.543 |  |  |
| 1.566000000000003 | 11.616 |  |  |
| 1.568000000000003 | 11.689 |  |  |
| 1.570000000000003 | 11.762 |  |  |
| 1.572000000000003 | 11.836 |  |  |
| 1.574000000000003 | 11.911 |  |  |
| 1.576000000000003 | 11.986 |  |  |
| 1.578000000000003 | 12.062 |  |  |
| 1.580000000000003 | 12.139 |  |  |
| 1.582000000000003 | 12.216 |  |  |
| 1.584000000000003 | 12.293 |  |  |
| 1.586000000000003 | 12.372 |  |  |
| 1.588000000000003 | 12.45 |  |  |
| 1.590000000000003 | 12.53 |  |  |
| 1.592000000000003 | 12.61 |  |  |
| 1.594000000000003 | 12.69 |  |  |
| 1.596000000000003 | 12.771 |  |  |
| 1.598000000000003 | 12.853 |  |  |
| 1.600000000000003 | 12.936 |  |  |
| 1.602000000000003 | 13.019 |  |  |
| 1.604000000000003 | 13.103 |  |  |
| 1.606000000000003 | 13.187 |  |  |
| 1.608000000000003 | 13.272 |  |  |
| 1.610000000000003 | 13.358 |  |  |
| 1.612000000000003 | 13.444 |  |  |
| 1.614000000000003 | 13.531 |  |  |
| 1.616000000000003 | 13.619 |  |  |
| 1.618000000000003 | 13.707 |  |  |
| 1.620000000000003 | 13.796 |  |  |
| 1.622000000000003 | 13.886 |  |  |
| 1.624000000000003 | 13.976 |  |  |
| 1.626000000000003 | 14.068 |  |  |
| 1.628000000000003 | 14.159 |  |  |
| 1.630000000000003 | 14.252 |  |  |
| 1.632000000000003 | 14.345 |  |  |
| 1.634000000000003 | 14.439 |  |  |
| 1.636000000000003 | 14.534 |  |  |
| 1.638000000000003 | 14.63 |  |  |
| 1.640000000000003 | 14.726 |  |  |
| 1.642000000000003 | 14.823 |  |  |
| 1.644000000000003 | 14.92 |  |  |
| 1.646000000000003 | 15.019 |  |  |
| 1.648000000000003 | 15.118 |  |  |
| 1.650000000000003 | 15.218 |  |  |
| 1.652000000000003 | 15.319 |  |  |
| 1.654000000000003 | 15.421 |  |  |
| 1.656000000000003 | 15.523 |  |  |
| 1.658000000000003 | 15.626 |  |  |
| 1.660000000000003 | 15.73 |  |  |
| 1.662000000000003 | 15.835 |  |  |
| 1.664000000000003 | 15.941 |  |  |
| 1.666000000000003 | 16.048 |  |  |
| 1.668000000000003 | 16.155 |  |  |
| 1.670000000000003 | 16.263 |  |  |
| 1.672000000000003 | 16.372 |  |  |
| 1.674000000000003 | 16.482 |  |  |
| 1.676000000000003 | 16.593 |  |  |
| 1.678000000000003 | 16.705 |  |  |
| 1.680000000000003 | 16.817 |  |  |
| 1.682000000000003 | 16.931 |  |  |
| 1.684000000000003 | 17.045 |  |  |
| 1.686000000000003 | 17.16 |  |  |
| 1.688000000000003 | 17.276 |  |  |
| 1.690000000000003 | 17.394 |  |  |
| 1.692000000000003 | 17.512 |  |  |
| 1.694000000000003 | 17.631 |  |  |
| 1.696000000000003 | 17.751 |  |  |
| 1.698000000000003 | 17.871 |  |  |
| 1.700000000000003 | 17.993 |  |  |
| 1.702000000000003 | 18.116 |  |  |
| 1.704000000000003 | 18.24 |  |  |
| 1.706000000000003 | 18.365 |  |  |
| 1.708000000000003 | 18.491 |  |  |
| 1.710000000000003 | 18.617 |  |  |
| 1.712000000000003 | 18.745 |  |  |
| 1.714000000000003 | 18.874 |  |  |
| 1.716000000000003 | 19.004 |  |  |
| 1.718000000000003 | 19.135 |  |  |
| 1.720000000000003 | 19.267 |  |  |
| 1.722000000000003 | 19.4 |  |  |
| 1.724000000000003 | 19.534 |  |  |
| 1.726000000000003 | 19.67 |  |  |
| 1.728000000000003 | 19.806 |  |  |
| 1.730000000000003 | 19.943 |  |  |
| 1.732000000000003 | 20.082 |  |  |
| 1.734000000000003 | 20.222 |  |  |
| 1.736000000000003 | 20.363 |  |  |
| 1.738000000000003 | 20.504 |  |  |
| 1.740000000000003 | 20.648 |  |  |
| 1.742000000000003 | 20.792 |  |  |
| 1.744000000000003 | 20.937 |  |  |
| 1.746000000000003 | 21.084 |  |  |
| 1.748000000000003 | 21.232 |  |  |
| 1.750000000000003 | 21.381 |  |  |
| 1.752000000000003 | 21.531 |  |  |
| 1.754000000000003 | 21.683 |  |  |
| 1.756000000000003 | 21.835 |  |  |
| 1.758000000000003 | 21.989 |  |  |
| 1.760000000000003 | 22.145 |  |  |
| 1.762000000000003 | 22.301 |  |  |
| 1.764000000000003 | 22.459 |  |  |
| 1.766000000000003 | 22.618 |  |  |
| 1.768000000000003 | 22.779 |  |  |
| 1.770000000000003 | 22.94 |  |  |
| 1.772000000000003 | 23.103 |  |  |
| 1.774000000000003 | 23.268 |  |  |
| 1.776000000000003 | 23.434 |  |  |
| 1.778000000000003 | 23.601 |  |  |
| 1.780000000000003 | 23.769 |  |  |
| 1.782000000000003 | 23.939 |  |  |
| 1.784000000000003 | 24.111 |  |  |
| 1.786000000000003 | 24.283 |  |  |
| 1.788000000000003 | 24.458 |  |  |
| 1.790000000000003 | 24.633 |  |  |
| 1.792000000000003 | 24.81 |  |  |
| 1.794000000000003 | 24.989 |  |  |
| 1.796000000000003 | 25.169 |  |  |
| 1.798000000000003 | 25.351 |  |  |
| 1.800000000000003 | 25.534 |  |  |
| 1.802000000000003 | 25.718 |  |  |
| 1.804000000000003 | 25.904 |  |  |
| 1.806000000000003 | 26.092 |  |  |
| 1.808000000000003 | 26.281 |  |  |
| 1.810000000000003 | 26.472 |  |  |
| 1.812000000000003 | 26.665 |  |  |
| 1.814000000000003 | 26.859 |  |  |
| 1.816000000000003 | 27.055 |  |  |
| 1.818000000000003 | 27.252 |  |  |
| 1.820000000000003 | 27.451 |  |  |
| 1.822000000000003 | 27.652 |  |  |
| 1.824000000000003 | 27.854 |  |  |
| 1.826000000000003 | 28.058 |  |  |
| 1.828000000000003 | 28.264 |  |  |
| 1.830000000000003 | 28.471 |  |  |
| 1.832000000000003 | 28.681 |  |  |
| 1.834000000000003 | 28.892 |  |  |
| 1.836000000000003 | 29.105 |  |  |
| 1.838000000000003 | 29.319 |  |  |
| 1.840000000000003 | 29.536 |  |  |
| 1.842000000000003 | 29.754 |  |  |
| 1.844000000000003 | 29.974 |  |  |
| 1.846000000000003 | 30.196 |  |  |
| 1.848000000000003 | 30.42 |  |  |
| 1.850000000000003 | 30.646 |  |  |
| 1.852000000000003 | 30.874 |  |  |
| 1.854000000000003 | 31.103 |  |  |
| 1.856000000000003 | 31.335 |  |  |
| 1.858000000000003 | 31.569 |  |  |
| 1.860000000000003 | 31.804 |  |  |
| 1.862000000000003 | 32.042 |  |  |
| 1.864000000000003 | 32.282 |  |  |
| 1.866000000000003 | 32.523 |  |  |
| 1.868000000000003 | 32.767 |  |  |
| 1.870000000000003 | 33.013 |  |  |
| 1.872000000000003 | 33.261 |  |  |
| 1.874000000000003 | 33.511 |  |  |
| 1.876000000000003 | 33.763 |  |  |
| 1.878000000000003 | 34.018 |  |  |
| 1.880000000000003 | 34.274 |  |  |
| 1.882000000000003 | 34.533 |  |  |
| 1.884000000000003 | 34.794 |  |  |
| 1.886000000000003 | 35.058 |  |  |
| 1.888000000000003 | 35.323 |  |  |
| 1.890000000000003 | 35.591 |  |  |
| 1.892000000000003 | 35.861 |  |  |
| 1.894000000000003 | 36.134 |  |  |
| 1.896000000000003 | 36.409 |  |  |
| 1.898000000000003 | 36.686 |  |  |
| 1.900000000000003 | 36.966 |  |  |
| 1.902000000000003 | 37.248 |  |  |
| 1.904000000000003 | 37.533 |  |  |
| 1.906000000000003 | 37.82 |  |  |
| 1.908000000000003 | 38.11 |  |  |
| 1.910000000000003 | 38.402 |  |  |
| 1.912000000000003 | 38.696 |  |  |
| 1.914000000000003 | 38.994 |  |  |
| 1.916000000000003 | 39.293 |  |  |
| 1.918000000000003 | 39.596 |  |  |
| 1.920000000000003 | 39.901 |  |  |
| 1.922000000000003 | 40.209 |  |  |
| 1.924000000000003 | 40.519 |  |  |
| 1.926000000000003 | 40.832 |  |  |
| 1.928000000000003 | 41.148 |  |  |
| 1.930000000000003 | 41.467 |  |  |
| 1.932000000000003 | 41.789 |  |  |
| 1.934000000000003 | 42.113 |  |  |
| 1.936000000000003 | 42.44 |  |  |
| 1.938000000000003 | 42.77 |  |  |
| 1.940000000000003 | 43.103 |  |  |
| 1.942000000000003 | 43.439 |  |  |
| 1.944000000000003 | 43.778 |  |  |
| 1.946000000000003 | 44.12 |  |  |
| 1.948000000000003 | 44.465 |  |  |
| 1.950000000000003 | 44.813 |  |  |
| 1.952000000000003 | 45.164 |  |  |
| 1.954000000000003 | 45.518 |  |  |
| 1.956000000000003 | 45.876 |  |  |
| 1.958000000000003 | 46.236 |  |  |
| 1.960000000000003 | 46.6 |  |  |
| 1.962000000000003 | 46.967 |  |  |
| 1.964000000000003 | 47.337 |  |  |
| 1.966000000000003 | 47.711 |  |  |
| 1.968000000000003 | 48.088 |  |  |
| 1.970000000000003 | 48.468 |  |  |
| 1.972000000000003 | 48.851 |  |  |
| 1.974000000000003 | 49.239 |  |  |
| 1.976000000000003 | 49.629 |  |  |
| 1.978000000000003 | 50.023 |  |  |
| 1.980000000000003 | 50.421 |  |  |
| 1.982000000000003 | 50.822 |  |  |
| 1.984000000000003 | 51.226 |  |  |
| 1.986000000000003 | 51.635 |  |  |
| 1.988000000000003 | 52.047 |  |  |
| 1.990000000000003 | 52.463 |  |  |
| 1.992000000000003 | 52.882 |  |  |
| 1.994000000000003 | 53.305 |  |  |
| 1.996000000000003 | 53.732 |  |  |
| 1.998000000000003 | 54.163 |  |  |
| 2.000000000000003 | 54.598 |  |  |